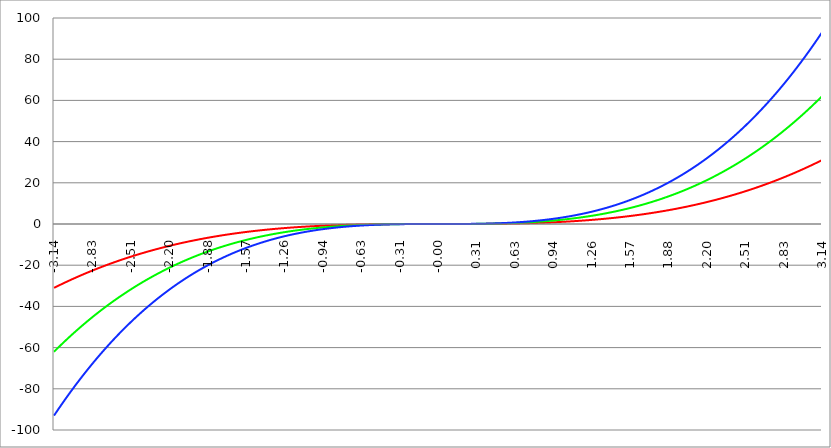
| Category | Series 1 | Series 0 | Series 2 |
|---|---|---|---|
| -3.141592653589793 | -31.006 | -62.013 | -93.019 |
| -3.138451060936204 | -30.913 | -61.827 | -92.74 |
| -3.135309468282614 | -30.821 | -61.641 | -92.462 |
| -3.132167875629024 | -30.728 | -61.456 | -92.184 |
| -3.129026282975434 | -30.636 | -61.271 | -91.907 |
| -3.125884690321845 | -30.544 | -61.087 | -91.631 |
| -3.122743097668256 | -30.452 | -60.903 | -91.355 |
| -3.119601505014666 | -30.36 | -60.719 | -91.079 |
| -3.116459912361076 | -30.268 | -60.536 | -90.804 |
| -3.113318319707487 | -30.177 | -60.353 | -90.53 |
| -3.110176727053897 | -30.085 | -60.171 | -90.256 |
| -3.107035134400308 | -29.994 | -59.989 | -89.983 |
| -3.103893541746717 | -29.903 | -59.807 | -89.71 |
| -3.100751949093128 | -29.813 | -59.625 | -89.438 |
| -3.097610356439539 | -29.722 | -59.444 | -89.166 |
| -3.094468763785949 | -29.632 | -59.264 | -88.895 |
| -3.09132717113236 | -29.542 | -59.083 | -88.625 |
| -3.08818557847877 | -29.452 | -58.903 | -88.355 |
| -3.08504398582518 | -29.362 | -58.724 | -88.086 |
| -3.081902393171591 | -29.272 | -58.545 | -87.817 |
| -3.078760800518001 | -29.183 | -58.366 | -87.549 |
| -3.075619207864412 | -29.094 | -58.187 | -87.281 |
| -3.072477615210822 | -29.005 | -58.009 | -87.014 |
| -3.069336022557232 | -28.916 | -57.831 | -86.747 |
| -3.066194429903643 | -28.827 | -57.654 | -86.481 |
| -3.063052837250053 | -28.738 | -57.477 | -86.215 |
| -3.059911244596463 | -28.65 | -57.3 | -85.95 |
| -3.056769651942874 | -28.562 | -57.124 | -85.686 |
| -3.053628059289284 | -28.474 | -56.948 | -85.422 |
| -3.050486466635695 | -28.386 | -56.772 | -85.159 |
| -3.047344873982105 | -28.299 | -56.597 | -84.896 |
| -3.044203281328516 | -28.211 | -56.422 | -84.633 |
| -3.041061688674926 | -28.124 | -56.248 | -84.372 |
| -3.037920096021336 | -28.037 | -56.074 | -84.111 |
| -3.034778503367747 | -27.95 | -55.9 | -83.85 |
| -3.031636910714157 | -27.863 | -55.726 | -83.59 |
| -3.028495318060568 | -27.777 | -55.553 | -83.33 |
| -3.025353725406978 | -27.69 | -55.381 | -83.071 |
| -3.022212132753388 | -27.604 | -55.208 | -82.813 |
| -3.019070540099799 | -27.518 | -55.036 | -82.555 |
| -3.015928947446209 | -27.432 | -54.865 | -82.297 |
| -3.01278735479262 | -27.347 | -54.693 | -82.04 |
| -3.00964576213903 | -27.261 | -54.523 | -81.784 |
| -3.00650416948544 | -27.176 | -54.352 | -81.528 |
| -3.003362576831851 | -27.091 | -54.182 | -81.273 |
| -3.000220984178261 | -27.006 | -54.012 | -81.018 |
| -2.997079391524672 | -26.921 | -53.842 | -80.764 |
| -2.993937798871082 | -26.837 | -53.673 | -80.51 |
| -2.990796206217492 | -26.752 | -53.505 | -80.257 |
| -2.987654613563903 | -26.668 | -53.336 | -80.004 |
| -2.984513020910313 | -26.584 | -53.168 | -79.752 |
| -2.981371428256724 | -26.5 | -53 | -79.5 |
| -2.978229835603134 | -26.416 | -52.833 | -79.249 |
| -2.975088242949544 | -26.333 | -52.666 | -78.999 |
| -2.971946650295955 | -26.25 | -52.499 | -78.749 |
| -2.968805057642365 | -26.166 | -52.333 | -78.499 |
| -2.965663464988776 | -26.083 | -52.167 | -78.25 |
| -2.962521872335186 | -26.001 | -52.001 | -78.002 |
| -2.959380279681596 | -25.918 | -51.836 | -77.754 |
| -2.956238687028007 | -25.836 | -51.671 | -77.507 |
| -2.953097094374417 | -25.753 | -51.507 | -77.26 |
| -2.949955501720828 | -25.671 | -51.342 | -77.014 |
| -2.946813909067238 | -25.589 | -51.179 | -76.768 |
| -2.943672316413648 | -25.508 | -51.015 | -76.523 |
| -2.940530723760059 | -25.426 | -50.852 | -76.278 |
| -2.937389131106469 | -25.345 | -50.689 | -76.034 |
| -2.93424753845288 | -25.263 | -50.527 | -75.79 |
| -2.93110594579929 | -25.182 | -50.365 | -75.547 |
| -2.9279643531457 | -25.101 | -50.203 | -75.304 |
| -2.924822760492111 | -25.021 | -50.041 | -75.062 |
| -2.921681167838521 | -24.94 | -49.88 | -74.82 |
| -2.918539575184932 | -24.86 | -49.72 | -74.579 |
| -2.915397982531342 | -24.78 | -49.559 | -74.339 |
| -2.912256389877752 | -24.7 | -49.399 | -74.099 |
| -2.909114797224163 | -24.62 | -49.239 | -73.859 |
| -2.905973204570573 | -24.54 | -49.08 | -73.62 |
| -2.902831611916984 | -24.461 | -48.921 | -73.382 |
| -2.899690019263394 | -24.381 | -48.762 | -73.144 |
| -2.896548426609804 | -24.302 | -48.604 | -72.906 |
| -2.893406833956215 | -24.223 | -48.446 | -72.669 |
| -2.890265241302625 | -24.144 | -48.288 | -72.433 |
| -2.887123648649035 | -24.066 | -48.131 | -72.197 |
| -2.883982055995446 | -23.987 | -47.974 | -71.961 |
| -2.880840463341856 | -23.909 | -47.818 | -71.726 |
| -2.877698870688267 | -23.831 | -47.661 | -71.492 |
| -2.874557278034677 | -23.753 | -47.505 | -71.258 |
| -2.871415685381088 | -23.675 | -47.35 | -71.025 |
| -2.868274092727498 | -23.597 | -47.195 | -70.792 |
| -2.865132500073908 | -23.52 | -47.04 | -70.559 |
| -2.861990907420319 | -23.443 | -46.885 | -70.328 |
| -2.858849314766729 | -23.365 | -46.731 | -70.096 |
| -2.85570772211314 | -23.288 | -46.577 | -69.865 |
| -2.85256612945955 | -23.212 | -46.423 | -69.635 |
| -2.84942453680596 | -23.135 | -46.27 | -69.405 |
| -2.846282944152371 | -23.059 | -46.117 | -69.176 |
| -2.843141351498781 | -22.982 | -45.965 | -68.947 |
| -2.839999758845192 | -22.906 | -45.813 | -68.719 |
| -2.836858166191602 | -22.83 | -45.661 | -68.491 |
| -2.833716573538012 | -22.755 | -45.509 | -68.264 |
| -2.830574980884423 | -22.679 | -45.358 | -68.037 |
| -2.827433388230833 | -22.604 | -45.207 | -67.811 |
| -2.824291795577244 | -22.528 | -45.057 | -67.585 |
| -2.821150202923654 | -22.453 | -44.906 | -67.36 |
| -2.818008610270065 | -22.378 | -44.757 | -67.135 |
| -2.814867017616475 | -22.304 | -44.607 | -66.911 |
| -2.811725424962885 | -22.229 | -44.458 | -66.687 |
| -2.808583832309296 | -22.155 | -44.309 | -66.464 |
| -2.805442239655706 | -22.08 | -44.161 | -66.241 |
| -2.802300647002116 | -22.006 | -44.012 | -66.018 |
| -2.799159054348527 | -21.932 | -43.864 | -65.797 |
| -2.796017461694937 | -21.858 | -43.717 | -65.575 |
| -2.792875869041348 | -21.785 | -43.57 | -65.355 |
| -2.789734276387758 | -21.711 | -43.423 | -65.134 |
| -2.786592683734168 | -21.638 | -43.276 | -64.915 |
| -2.783451091080579 | -21.565 | -43.13 | -64.695 |
| -2.78030949842699 | -21.492 | -42.984 | -64.476 |
| -2.7771679057734 | -21.419 | -42.839 | -64.258 |
| -2.77402631311981 | -21.347 | -42.693 | -64.04 |
| -2.770884720466221 | -21.274 | -42.549 | -63.823 |
| -2.767743127812631 | -21.202 | -42.404 | -63.606 |
| -2.764601535159041 | -21.13 | -42.26 | -63.39 |
| -2.761459942505452 | -21.058 | -42.116 | -63.174 |
| -2.758318349851862 | -20.986 | -41.972 | -62.959 |
| -2.755176757198272 | -20.915 | -41.829 | -62.744 |
| -2.752035164544683 | -20.843 | -41.686 | -62.529 |
| -2.748893571891093 | -20.772 | -41.544 | -62.315 |
| -2.745751979237504 | -20.701 | -41.401 | -62.102 |
| -2.742610386583914 | -20.63 | -41.259 | -61.889 |
| -2.739468793930325 | -20.559 | -41.118 | -61.677 |
| -2.736327201276735 | -20.488 | -40.976 | -61.465 |
| -2.733185608623145 | -20.418 | -40.835 | -61.253 |
| -2.730044015969556 | -20.347 | -40.695 | -61.042 |
| -2.726902423315966 | -20.277 | -40.554 | -60.832 |
| -2.723760830662376 | -20.207 | -40.414 | -60.622 |
| -2.720619238008787 | -20.137 | -40.275 | -60.412 |
| -2.717477645355197 | -20.068 | -40.135 | -60.203 |
| -2.714336052701607 | -19.998 | -39.996 | -59.995 |
| -2.711194460048018 | -19.929 | -39.858 | -59.787 |
| -2.708052867394429 | -19.86 | -39.719 | -59.579 |
| -2.704911274740839 | -19.791 | -39.581 | -59.372 |
| -2.701769682087249 | -19.722 | -39.443 | -59.165 |
| -2.69862808943366 | -19.653 | -39.306 | -58.959 |
| -2.69548649678007 | -19.584 | -39.169 | -58.753 |
| -2.692344904126481 | -19.516 | -39.032 | -58.548 |
| -2.689203311472891 | -19.448 | -38.896 | -58.343 |
| -2.686061718819301 | -19.38 | -38.759 | -58.139 |
| -2.682920126165712 | -19.312 | -38.624 | -57.935 |
| -2.679778533512122 | -19.244 | -38.488 | -57.732 |
| -2.676636940858533 | -19.176 | -38.353 | -57.529 |
| -2.673495348204943 | -19.109 | -38.218 | -57.327 |
| -2.670353755551353 | -19.042 | -38.083 | -57.125 |
| -2.667212162897764 | -18.975 | -37.949 | -56.924 |
| -2.664070570244174 | -18.908 | -37.815 | -56.723 |
| -2.660928977590585 | -18.841 | -37.682 | -56.522 |
| -2.657787384936995 | -18.774 | -37.548 | -56.323 |
| -2.654645792283405 | -18.708 | -37.415 | -56.123 |
| -2.651504199629816 | -18.641 | -37.283 | -55.924 |
| -2.648362606976226 | -18.575 | -37.15 | -55.725 |
| -2.645221014322636 | -18.509 | -37.018 | -55.527 |
| -2.642079421669047 | -18.443 | -36.887 | -55.33 |
| -2.638937829015457 | -18.378 | -36.755 | -55.133 |
| -2.635796236361868 | -18.312 | -36.624 | -54.936 |
| -2.632654643708278 | -18.247 | -36.493 | -54.74 |
| -2.629513051054689 | -18.181 | -36.363 | -54.544 |
| -2.626371458401099 | -18.116 | -36.233 | -54.349 |
| -2.62322986574751 | -18.051 | -36.103 | -54.154 |
| -2.62008827309392 | -17.987 | -35.973 | -53.96 |
| -2.61694668044033 | -17.922 | -35.844 | -53.766 |
| -2.613805087786741 | -17.857 | -35.715 | -53.572 |
| -2.610663495133151 | -17.793 | -35.586 | -53.379 |
| -2.607521902479561 | -17.729 | -35.458 | -53.187 |
| -2.604380309825972 | -17.665 | -35.33 | -52.995 |
| -2.601238717172382 | -17.601 | -35.202 | -52.803 |
| -2.598097124518793 | -17.537 | -35.075 | -52.612 |
| -2.594955531865203 | -17.474 | -34.948 | -52.422 |
| -2.591813939211613 | -17.411 | -34.821 | -52.232 |
| -2.588672346558024 | -17.347 | -34.695 | -52.042 |
| -2.585530753904434 | -17.284 | -34.568 | -51.853 |
| -2.582389161250845 | -17.221 | -34.443 | -51.664 |
| -2.579247568597255 | -17.158 | -34.317 | -51.475 |
| -2.576105975943666 | -17.096 | -34.192 | -51.288 |
| -2.572964383290076 | -17.033 | -34.067 | -51.1 |
| -2.569822790636486 | -16.971 | -33.942 | -50.913 |
| -2.566681197982897 | -16.909 | -33.818 | -50.727 |
| -2.563539605329307 | -16.847 | -33.694 | -50.541 |
| -2.560398012675717 | -16.785 | -33.57 | -50.355 |
| -2.557256420022128 | -16.723 | -33.447 | -50.17 |
| -2.554114827368538 | -16.662 | -33.324 | -49.985 |
| -2.550973234714949 | -16.6 | -33.201 | -49.801 |
| -2.54783164206136 | -16.539 | -33.078 | -49.617 |
| -2.54469004940777 | -16.478 | -32.956 | -49.434 |
| -2.54154845675418 | -16.417 | -32.834 | -49.251 |
| -2.53840686410059 | -16.356 | -32.712 | -49.069 |
| -2.535265271447001 | -16.296 | -32.591 | -48.887 |
| -2.532123678793411 | -16.235 | -32.47 | -48.705 |
| -2.528982086139822 | -16.175 | -32.349 | -48.524 |
| -2.525840493486232 | -16.115 | -32.229 | -48.344 |
| -2.522698900832642 | -16.054 | -32.109 | -48.163 |
| -2.519557308179053 | -15.995 | -31.989 | -47.984 |
| -2.516415715525463 | -15.935 | -31.87 | -47.804 |
| -2.513274122871874 | -15.875 | -31.75 | -47.626 |
| -2.510132530218284 | -15.816 | -31.632 | -47.447 |
| -2.506990937564694 | -15.756 | -31.513 | -47.269 |
| -2.503849344911105 | -15.697 | -31.395 | -47.092 |
| -2.500707752257515 | -15.638 | -31.277 | -46.915 |
| -2.497566159603926 | -15.579 | -31.159 | -46.738 |
| -2.494424566950336 | -15.521 | -31.041 | -46.562 |
| -2.491282974296746 | -15.462 | -30.924 | -46.386 |
| -2.488141381643157 | -15.404 | -30.807 | -46.211 |
| -2.484999788989567 | -15.345 | -30.691 | -46.036 |
| -2.481858196335978 | -15.287 | -30.575 | -45.862 |
| -2.478716603682388 | -15.229 | -30.459 | -45.688 |
| -2.475575011028798 | -15.171 | -30.343 | -45.514 |
| -2.472433418375209 | -15.114 | -30.228 | -45.341 |
| -2.46929182572162 | -15.056 | -30.113 | -45.169 |
| -2.46615023306803 | -14.999 | -29.998 | -44.997 |
| -2.46300864041444 | -14.942 | -29.883 | -44.825 |
| -2.45986704776085 | -14.885 | -29.769 | -44.654 |
| -2.456725455107261 | -14.828 | -29.655 | -44.483 |
| -2.453583862453671 | -14.771 | -29.542 | -44.312 |
| -2.450442269800082 | -14.714 | -29.428 | -44.142 |
| -2.447300677146492 | -14.658 | -29.315 | -43.973 |
| -2.444159084492902 | -14.601 | -29.202 | -43.804 |
| -2.441017491839313 | -14.545 | -29.09 | -43.635 |
| -2.437875899185723 | -14.489 | -28.978 | -43.467 |
| -2.434734306532133 | -14.433 | -28.866 | -43.299 |
| -2.431592713878544 | -14.377 | -28.754 | -43.131 |
| -2.428451121224954 | -14.321 | -28.643 | -42.964 |
| -2.425309528571365 | -14.266 | -28.532 | -42.798 |
| -2.422167935917775 | -14.211 | -28.421 | -42.632 |
| -2.419026343264186 | -14.155 | -28.311 | -42.466 |
| -2.415884750610596 | -14.1 | -28.201 | -42.301 |
| -2.412743157957006 | -14.045 | -28.091 | -42.136 |
| -2.409601565303417 | -13.991 | -27.981 | -41.972 |
| -2.406459972649827 | -13.936 | -27.872 | -41.808 |
| -2.403318379996238 | -13.881 | -27.763 | -41.644 |
| -2.400176787342648 | -13.827 | -27.654 | -41.481 |
| -2.397035194689058 | -13.773 | -27.546 | -41.318 |
| -2.393893602035469 | -13.719 | -27.437 | -41.156 |
| -2.390752009381879 | -13.665 | -27.33 | -40.994 |
| -2.38761041672829 | -13.611 | -27.222 | -40.833 |
| -2.3844688240747 | -13.557 | -27.115 | -40.672 |
| -2.38132723142111 | -13.504 | -27.008 | -40.512 |
| -2.378185638767521 | -13.45 | -26.901 | -40.351 |
| -2.375044046113931 | -13.397 | -26.794 | -40.192 |
| -2.371902453460342 | -13.344 | -26.688 | -40.032 |
| -2.368760860806752 | -13.291 | -26.582 | -39.874 |
| -2.365619268153162 | -13.238 | -26.477 | -39.715 |
| -2.362477675499573 | -13.186 | -26.371 | -39.557 |
| -2.359336082845983 | -13.133 | -26.266 | -39.399 |
| -2.356194490192394 | -13.081 | -26.162 | -39.242 |
| -2.353052897538804 | -13.029 | -26.057 | -39.086 |
| -2.349911304885214 | -12.976 | -25.953 | -38.929 |
| -2.346769712231625 | -12.924 | -25.849 | -38.773 |
| -2.343628119578035 | -12.873 | -25.745 | -38.618 |
| -2.340486526924446 | -12.821 | -25.642 | -38.463 |
| -2.337344934270856 | -12.769 | -25.539 | -38.308 |
| -2.334203341617266 | -12.718 | -25.436 | -38.154 |
| -2.331061748963677 | -12.667 | -25.333 | -38 |
| -2.327920156310087 | -12.615 | -25.231 | -37.846 |
| -2.324778563656498 | -12.564 | -25.129 | -37.693 |
| -2.321636971002908 | -12.514 | -25.027 | -37.541 |
| -2.318495378349318 | -12.463 | -24.926 | -37.389 |
| -2.315353785695729 | -12.412 | -24.825 | -37.237 |
| -2.312212193042139 | -12.362 | -24.724 | -37.086 |
| -2.30907060038855 | -12.312 | -24.623 | -36.935 |
| -2.30592900773496 | -12.261 | -24.523 | -36.784 |
| -2.30278741508137 | -12.211 | -24.423 | -36.634 |
| -2.299645822427781 | -12.161 | -24.323 | -36.484 |
| -2.296504229774191 | -12.112 | -24.223 | -36.335 |
| -2.293362637120602 | -12.062 | -24.124 | -36.186 |
| -2.290221044467012 | -12.012 | -24.025 | -36.037 |
| -2.287079451813422 | -11.963 | -23.926 | -35.889 |
| -2.283937859159832 | -11.914 | -23.828 | -35.742 |
| -2.280796266506243 | -11.865 | -23.73 | -35.594 |
| -2.277654673852654 | -11.816 | -23.632 | -35.447 |
| -2.274513081199064 | -11.767 | -23.534 | -35.301 |
| -2.271371488545474 | -11.718 | -23.437 | -35.155 |
| -2.268229895891885 | -11.67 | -23.339 | -35.009 |
| -2.265088303238295 | -11.621 | -23.243 | -34.864 |
| -2.261946710584706 | -11.573 | -23.146 | -34.719 |
| -2.258805117931116 | -11.525 | -23.05 | -34.575 |
| -2.255663525277527 | -11.477 | -22.954 | -34.431 |
| -2.252521932623937 | -11.429 | -22.858 | -34.287 |
| -2.249380339970347 | -11.381 | -22.762 | -34.144 |
| -2.246238747316757 | -11.334 | -22.667 | -34.001 |
| -2.243097154663168 | -11.286 | -22.572 | -33.858 |
| -2.239955562009579 | -11.239 | -22.478 | -33.716 |
| -2.236813969355989 | -11.192 | -22.383 | -33.575 |
| -2.2336723767024 | -11.144 | -22.289 | -33.433 |
| -2.23053078404881 | -11.097 | -22.195 | -33.292 |
| -2.22738919139522 | -11.051 | -22.101 | -33.152 |
| -2.22424759874163 | -11.004 | -22.008 | -33.012 |
| -2.221106006088041 | -10.957 | -21.915 | -32.872 |
| -2.217964413434451 | -10.911 | -21.822 | -32.733 |
| -2.214822820780862 | -10.865 | -21.729 | -32.594 |
| -2.211681228127272 | -10.819 | -21.637 | -32.456 |
| -2.208539635473683 | -10.772 | -21.545 | -32.317 |
| -2.205398042820092 | -10.727 | -21.453 | -32.18 |
| -2.202256450166503 | -10.681 | -21.362 | -32.042 |
| -2.199114857512913 | -10.635 | -21.27 | -31.905 |
| -2.195973264859324 | -10.59 | -21.179 | -31.769 |
| -2.192831672205735 | -10.544 | -21.089 | -31.633 |
| -2.189690079552145 | -10.499 | -20.998 | -31.497 |
| -2.186548486898555 | -10.454 | -20.908 | -31.362 |
| -2.183406894244966 | -10.409 | -20.818 | -31.227 |
| -2.180265301591376 | -10.364 | -20.728 | -31.092 |
| -2.177123708937786 | -10.319 | -20.639 | -30.958 |
| -2.173982116284197 | -10.275 | -20.549 | -30.824 |
| -2.170840523630607 | -10.23 | -20.46 | -30.691 |
| -2.167698930977018 | -10.186 | -20.372 | -30.558 |
| -2.164557338323428 | -10.142 | -20.283 | -30.425 |
| -2.161415745669839 | -10.098 | -20.195 | -30.293 |
| -2.158274153016249 | -10.054 | -20.107 | -30.161 |
| -2.15513256036266 | -10.01 | -20.019 | -30.029 |
| -2.15199096770907 | -9.966 | -19.932 | -29.898 |
| -2.14884937505548 | -9.922 | -19.845 | -29.767 |
| -2.14570778240189 | -9.879 | -19.758 | -29.637 |
| -2.142566189748301 | -9.836 | -19.671 | -29.507 |
| -2.139424597094711 | -9.792 | -19.585 | -29.377 |
| -2.136283004441122 | -9.749 | -19.499 | -29.248 |
| -2.133141411787532 | -9.706 | -19.413 | -29.119 |
| -2.129999819133943 | -9.664 | -19.327 | -28.991 |
| -2.126858226480353 | -9.621 | -19.242 | -28.863 |
| -2.123716633826763 | -9.578 | -19.157 | -28.735 |
| -2.120575041173174 | -9.536 | -19.072 | -28.608 |
| -2.117433448519584 | -9.494 | -18.987 | -28.481 |
| -2.114291855865994 | -9.451 | -18.903 | -28.354 |
| -2.111150263212405 | -9.409 | -18.819 | -28.228 |
| -2.108008670558815 | -9.367 | -18.735 | -28.102 |
| -2.104867077905226 | -9.326 | -18.651 | -27.977 |
| -2.101725485251636 | -9.284 | -18.568 | -27.852 |
| -2.098583892598047 | -9.242 | -18.485 | -27.727 |
| -2.095442299944457 | -9.201 | -18.402 | -27.602 |
| -2.092300707290867 | -9.16 | -18.319 | -27.479 |
| -2.089159114637278 | -9.118 | -18.237 | -27.355 |
| -2.086017521983688 | -9.077 | -18.154 | -27.232 |
| -2.082875929330099 | -9.036 | -18.073 | -27.109 |
| -2.07973433667651 | -8.995 | -17.991 | -26.986 |
| -2.07659274402292 | -8.955 | -17.91 | -26.864 |
| -2.07345115136933 | -8.914 | -17.828 | -26.743 |
| -2.07030955871574 | -8.874 | -17.747 | -26.621 |
| -2.06716796606215 | -8.833 | -17.667 | -26.5 |
| -2.064026373408561 | -8.793 | -17.586 | -26.38 |
| -2.060884780754971 | -8.753 | -17.506 | -26.259 |
| -2.057743188101382 | -8.713 | -17.426 | -26.139 |
| -2.054601595447792 | -8.673 | -17.347 | -26.02 |
| -2.051460002794203 | -8.634 | -17.267 | -25.901 |
| -2.048318410140613 | -8.594 | -17.188 | -25.782 |
| -2.045176817487023 | -8.554 | -17.109 | -25.663 |
| -2.042035224833434 | -8.515 | -17.03 | -25.545 |
| -2.038893632179844 | -8.476 | -16.952 | -25.428 |
| -2.035752039526255 | -8.437 | -16.873 | -25.31 |
| -2.032610446872665 | -8.398 | -16.795 | -25.193 |
| -2.029468854219076 | -8.359 | -16.718 | -25.077 |
| -2.026327261565486 | -8.32 | -16.64 | -24.96 |
| -2.023185668911896 | -8.281 | -16.563 | -24.844 |
| -2.020044076258307 | -8.243 | -16.486 | -24.729 |
| -2.016902483604717 | -8.205 | -16.409 | -24.614 |
| -2.013760890951128 | -8.166 | -16.333 | -24.499 |
| -2.010619298297538 | -8.128 | -16.256 | -24.384 |
| -2.007477705643948 | -8.09 | -16.18 | -24.27 |
| -2.004336112990358 | -8.052 | -16.104 | -24.156 |
| -2.00119452033677 | -8.014 | -16.029 | -24.043 |
| -1.99805292768318 | -7.977 | -15.953 | -23.93 |
| -1.994911335029589 | -7.939 | -15.878 | -23.817 |
| -1.991769742376 | -7.902 | -15.803 | -23.705 |
| -1.98862814972241 | -7.864 | -15.729 | -23.593 |
| -1.98548655706882 | -7.827 | -15.654 | -23.481 |
| -1.98234496441523 | -7.79 | -15.58 | -23.37 |
| -1.97920337176164 | -7.753 | -15.506 | -23.259 |
| -1.976061779108051 | -7.716 | -15.432 | -23.148 |
| -1.972920186454461 | -7.679 | -15.359 | -23.038 |
| -1.969778593800871 | -7.643 | -15.286 | -22.928 |
| -1.966637001147281 | -7.606 | -15.213 | -22.819 |
| -1.963495408493691 | -7.57 | -15.14 | -22.71 |
| -1.960353815840101 | -7.534 | -15.067 | -22.601 |
| -1.957212223186512 | -7.497 | -14.995 | -22.492 |
| -1.954070630532922 | -7.461 | -14.923 | -22.384 |
| -1.950929037879332 | -7.425 | -14.851 | -22.276 |
| -1.947787445225742 | -7.39 | -14.779 | -22.169 |
| -1.944645852572152 | -7.354 | -14.708 | -22.062 |
| -1.941504259918563 | -7.318 | -14.637 | -21.955 |
| -1.938362667264973 | -7.283 | -14.566 | -21.849 |
| -1.935221074611383 | -7.248 | -14.495 | -21.743 |
| -1.932079481957793 | -7.212 | -14.425 | -21.637 |
| -1.928937889304203 | -7.177 | -14.354 | -21.532 |
| -1.925796296650613 | -7.142 | -14.284 | -21.427 |
| -1.922654703997024 | -7.107 | -14.215 | -21.322 |
| -1.919513111343434 | -7.073 | -14.145 | -21.218 |
| -1.916371518689844 | -7.038 | -14.076 | -21.114 |
| -1.913229926036254 | -7.003 | -14.007 | -21.01 |
| -1.910088333382664 | -6.969 | -13.938 | -20.907 |
| -1.906946740729075 | -6.935 | -13.869 | -20.804 |
| -1.903805148075485 | -6.9 | -13.801 | -20.701 |
| -1.900663555421895 | -6.866 | -13.732 | -20.599 |
| -1.897521962768305 | -6.832 | -13.664 | -20.497 |
| -1.894380370114715 | -6.798 | -13.597 | -20.395 |
| -1.891238777461125 | -6.765 | -13.529 | -20.294 |
| -1.888097184807536 | -6.731 | -13.462 | -20.193 |
| -1.884955592153946 | -6.697 | -13.395 | -20.092 |
| -1.881813999500356 | -6.664 | -13.328 | -19.992 |
| -1.878672406846766 | -6.631 | -13.261 | -19.892 |
| -1.875530814193176 | -6.597 | -13.195 | -19.792 |
| -1.872389221539586 | -6.564 | -13.129 | -19.693 |
| -1.869247628885997 | -6.531 | -13.063 | -19.594 |
| -1.866106036232407 | -6.498 | -12.997 | -19.495 |
| -1.862964443578817 | -6.466 | -12.931 | -19.397 |
| -1.859822850925227 | -6.433 | -12.866 | -19.299 |
| -1.856681258271637 | -6.4 | -12.801 | -19.201 |
| -1.853539665618048 | -6.368 | -12.736 | -19.104 |
| -1.850398072964458 | -6.336 | -12.671 | -19.007 |
| -1.847256480310868 | -6.303 | -12.607 | -18.91 |
| -1.844114887657278 | -6.271 | -12.543 | -18.814 |
| -1.840973295003688 | -6.239 | -12.479 | -18.718 |
| -1.837831702350098 | -6.208 | -12.415 | -18.623 |
| -1.834690109696509 | -6.176 | -12.351 | -18.527 |
| -1.831548517042919 | -6.144 | -12.288 | -18.432 |
| -1.82840692438933 | -6.112 | -12.225 | -18.337 |
| -1.82526533173574 | -6.081 | -12.162 | -18.243 |
| -1.822123739082149 | -6.05 | -12.099 | -18.149 |
| -1.81898214642856 | -6.018 | -12.037 | -18.055 |
| -1.81584055377497 | -5.987 | -11.975 | -17.962 |
| -1.81269896112138 | -5.956 | -11.913 | -17.869 |
| -1.80955736846779 | -5.925 | -11.851 | -17.776 |
| -1.8064157758142 | -5.895 | -11.789 | -17.684 |
| -1.80327418316061 | -5.864 | -11.728 | -17.592 |
| -1.800132590507021 | -5.833 | -11.667 | -17.5 |
| -1.796990997853431 | -5.803 | -11.606 | -17.408 |
| -1.793849405199841 | -5.772 | -11.545 | -17.317 |
| -1.790707812546251 | -5.742 | -11.484 | -17.226 |
| -1.787566219892661 | -5.712 | -11.424 | -17.136 |
| -1.784424627239071 | -5.682 | -11.364 | -17.046 |
| -1.781283034585482 | -5.652 | -11.304 | -16.956 |
| -1.778141441931892 | -5.622 | -11.244 | -16.866 |
| -1.774999849278302 | -5.592 | -11.185 | -16.777 |
| -1.771858256624712 | -5.563 | -11.125 | -16.688 |
| -1.768716663971122 | -5.533 | -11.066 | -16.6 |
| -1.765575071317533 | -5.504 | -11.007 | -16.511 |
| -1.762433478663943 | -5.474 | -10.949 | -16.423 |
| -1.759291886010353 | -5.445 | -10.89 | -16.336 |
| -1.756150293356763 | -5.416 | -10.832 | -16.248 |
| -1.753008700703173 | -5.387 | -10.774 | -16.161 |
| -1.749867108049583 | -5.358 | -10.716 | -16.074 |
| -1.746725515395994 | -5.329 | -10.659 | -15.988 |
| -1.743583922742404 | -5.301 | -10.601 | -15.902 |
| -1.740442330088814 | -5.272 | -10.544 | -15.816 |
| -1.737300737435224 | -5.244 | -10.487 | -15.731 |
| -1.734159144781634 | -5.215 | -10.43 | -15.645 |
| -1.731017552128045 | -5.187 | -10.374 | -15.561 |
| -1.727875959474455 | -5.159 | -10.317 | -15.476 |
| -1.724734366820865 | -5.131 | -10.261 | -15.392 |
| -1.721592774167275 | -5.103 | -10.205 | -15.308 |
| -1.718451181513685 | -5.075 | -10.149 | -15.224 |
| -1.715309588860095 | -5.047 | -10.094 | -15.141 |
| -1.712167996206506 | -5.019 | -10.039 | -15.058 |
| -1.709026403552916 | -4.992 | -9.983 | -14.975 |
| -1.705884810899326 | -4.964 | -9.928 | -14.893 |
| -1.702743218245736 | -4.937 | -9.874 | -14.81 |
| -1.699601625592146 | -4.91 | -9.819 | -14.729 |
| -1.696460032938557 | -4.882 | -9.765 | -14.647 |
| -1.693318440284967 | -4.855 | -9.711 | -14.566 |
| -1.690176847631377 | -4.828 | -9.657 | -14.485 |
| -1.687035254977787 | -4.801 | -9.603 | -14.404 |
| -1.683893662324197 | -4.775 | -9.549 | -14.324 |
| -1.680752069670607 | -4.748 | -9.496 | -14.244 |
| -1.677610477017018 | -4.721 | -9.443 | -14.164 |
| -1.674468884363428 | -4.695 | -9.39 | -14.085 |
| -1.671327291709838 | -4.669 | -9.337 | -14.006 |
| -1.668185699056248 | -4.642 | -9.285 | -13.927 |
| -1.665044106402658 | -4.616 | -9.232 | -13.848 |
| -1.661902513749069 | -4.59 | -9.18 | -13.77 |
| -1.658760921095479 | -4.564 | -9.128 | -13.692 |
| -1.655619328441889 | -4.538 | -9.076 | -13.615 |
| -1.6524777357883 | -4.512 | -9.025 | -13.537 |
| -1.649336143134709 | -4.487 | -8.973 | -13.46 |
| -1.646194550481119 | -4.461 | -8.922 | -13.383 |
| -1.64305295782753 | -4.436 | -8.871 | -13.307 |
| -1.63991136517394 | -4.41 | -8.82 | -13.231 |
| -1.63676977252035 | -4.385 | -8.77 | -13.155 |
| -1.63362817986676 | -4.36 | -8.719 | -13.079 |
| -1.63048658721317 | -4.335 | -8.669 | -13.004 |
| -1.62734499455958 | -4.31 | -8.619 | -12.929 |
| -1.624203401905991 | -4.285 | -8.569 | -12.854 |
| -1.621061809252401 | -4.26 | -8.52 | -12.78 |
| -1.617920216598811 | -4.235 | -8.47 | -12.706 |
| -1.614778623945221 | -4.211 | -8.421 | -12.632 |
| -1.611637031291631 | -4.186 | -8.372 | -12.558 |
| -1.608495438638042 | -4.162 | -8.323 | -12.485 |
| -1.605353845984452 | -4.137 | -8.275 | -12.412 |
| -1.602212253330862 | -4.113 | -8.226 | -12.339 |
| -1.599070660677272 | -4.089 | -8.178 | -12.267 |
| -1.595929068023682 | -4.065 | -8.13 | -12.194 |
| -1.592787475370093 | -4.041 | -8.082 | -12.123 |
| -1.589645882716503 | -4.017 | -8.034 | -12.051 |
| -1.586504290062913 | -3.993 | -7.986 | -11.98 |
| -1.583362697409323 | -3.97 | -7.939 | -11.909 |
| -1.580221104755733 | -3.946 | -7.892 | -11.838 |
| -1.577079512102143 | -3.922 | -7.845 | -11.767 |
| -1.573937919448554 | -3.899 | -7.798 | -11.697 |
| -1.570796326794964 | -3.876 | -7.752 | -11.627 |
| -1.567654734141374 | -3.853 | -7.705 | -11.558 |
| -1.564513141487784 | -3.829 | -7.659 | -11.488 |
| -1.561371548834194 | -3.806 | -7.613 | -11.419 |
| -1.558229956180605 | -3.784 | -7.567 | -11.351 |
| -1.555088363527015 | -3.761 | -7.521 | -11.282 |
| -1.551946770873425 | -3.738 | -7.476 | -11.214 |
| -1.548805178219835 | -3.715 | -7.431 | -11.146 |
| -1.545663585566245 | -3.693 | -7.385 | -11.078 |
| -1.542521992912655 | -3.67 | -7.34 | -11.011 |
| -1.539380400259066 | -3.648 | -7.296 | -10.944 |
| -1.536238807605476 | -3.626 | -7.251 | -10.877 |
| -1.533097214951886 | -3.603 | -7.207 | -10.81 |
| -1.529955622298296 | -3.581 | -7.163 | -10.744 |
| -1.526814029644706 | -3.559 | -7.118 | -10.678 |
| -1.523672436991117 | -3.537 | -7.075 | -10.612 |
| -1.520530844337527 | -3.515 | -7.031 | -10.546 |
| -1.517389251683937 | -3.494 | -6.987 | -10.481 |
| -1.514247659030347 | -3.472 | -6.944 | -10.416 |
| -1.511106066376757 | -3.451 | -6.901 | -10.352 |
| -1.507964473723167 | -3.429 | -6.858 | -10.287 |
| -1.504822881069578 | -3.408 | -6.815 | -10.223 |
| -1.501681288415988 | -3.386 | -6.773 | -10.159 |
| -1.498539695762398 | -3.365 | -6.73 | -10.095 |
| -1.495398103108808 | -3.344 | -6.688 | -10.032 |
| -1.492256510455218 | -3.323 | -6.646 | -9.969 |
| -1.489114917801628 | -3.302 | -6.604 | -9.906 |
| -1.485973325148039 | -3.281 | -6.562 | -9.844 |
| -1.482831732494449 | -3.26 | -6.521 | -9.781 |
| -1.47969013984086 | -3.24 | -6.48 | -9.719 |
| -1.476548547187269 | -3.219 | -6.438 | -9.657 |
| -1.473406954533679 | -3.199 | -6.397 | -9.596 |
| -1.47026536188009 | -3.178 | -6.356 | -9.535 |
| -1.4671237692265 | -3.158 | -6.316 | -9.474 |
| -1.46398217657291 | -3.138 | -6.275 | -9.413 |
| -1.46084058391932 | -3.118 | -6.235 | -9.353 |
| -1.45769899126573 | -3.097 | -6.195 | -9.292 |
| -1.45455739861214 | -3.077 | -6.155 | -9.232 |
| -1.451415805958551 | -3.058 | -6.115 | -9.173 |
| -1.448274213304961 | -3.038 | -6.076 | -9.113 |
| -1.445132620651371 | -3.018 | -6.036 | -9.054 |
| -1.441991027997781 | -2.998 | -5.997 | -8.995 |
| -1.438849435344191 | -2.979 | -5.958 | -8.936 |
| -1.435707842690602 | -2.959 | -5.919 | -8.878 |
| -1.432566250037012 | -2.94 | -5.88 | -8.82 |
| -1.429424657383422 | -2.921 | -5.841 | -8.762 |
| -1.426283064729832 | -2.901 | -5.803 | -8.704 |
| -1.423141472076242 | -2.882 | -5.765 | -8.647 |
| -1.419999879422652 | -2.863 | -5.727 | -8.59 |
| -1.416858286769063 | -2.844 | -5.689 | -8.533 |
| -1.413716694115473 | -2.825 | -5.651 | -8.476 |
| -1.410575101461883 | -2.807 | -5.613 | -8.42 |
| -1.407433508808293 | -2.788 | -5.576 | -8.364 |
| -1.404291916154703 | -2.769 | -5.539 | -8.308 |
| -1.401150323501114 | -2.751 | -5.502 | -8.252 |
| -1.398008730847524 | -2.732 | -5.465 | -8.197 |
| -1.394867138193934 | -2.714 | -5.428 | -8.142 |
| -1.391725545540344 | -2.696 | -5.391 | -8.087 |
| -1.388583952886754 | -2.677 | -5.355 | -8.032 |
| -1.385442360233164 | -2.659 | -5.319 | -7.978 |
| -1.382300767579575 | -2.641 | -5.282 | -7.924 |
| -1.379159174925985 | -2.623 | -5.247 | -7.87 |
| -1.376017582272395 | -2.605 | -5.211 | -7.816 |
| -1.372875989618805 | -2.588 | -5.175 | -7.763 |
| -1.369734396965215 | -2.57 | -5.14 | -7.71 |
| -1.366592804311625 | -2.552 | -5.104 | -7.657 |
| -1.363451211658036 | -2.535 | -5.069 | -7.604 |
| -1.360309619004446 | -2.517 | -5.034 | -7.552 |
| -1.357168026350856 | -2.5 | -5 | -7.499 |
| -1.354026433697266 | -2.482 | -4.965 | -7.447 |
| -1.350884841043676 | -2.465 | -4.93 | -7.396 |
| -1.347743248390087 | -2.448 | -4.896 | -7.344 |
| -1.344601655736497 | -2.431 | -4.862 | -7.293 |
| -1.341460063082907 | -2.414 | -4.828 | -7.242 |
| -1.338318470429317 | -2.397 | -4.794 | -7.191 |
| -1.335176877775727 | -2.38 | -4.76 | -7.141 |
| -1.332035285122137 | -2.363 | -4.727 | -7.09 |
| -1.328893692468548 | -2.347 | -4.694 | -7.04 |
| -1.325752099814958 | -2.33 | -4.66 | -6.99 |
| -1.322610507161368 | -2.314 | -4.627 | -6.941 |
| -1.319468914507778 | -2.297 | -4.594 | -6.892 |
| -1.316327321854188 | -2.281 | -4.562 | -6.842 |
| -1.313185729200599 | -2.265 | -4.529 | -6.794 |
| -1.310044136547009 | -2.248 | -4.497 | -6.745 |
| -1.306902543893419 | -2.232 | -4.464 | -6.697 |
| -1.303760951239829 | -2.216 | -4.432 | -6.648 |
| -1.300619358586239 | -2.2 | -4.4 | -6.6 |
| -1.297477765932649 | -2.184 | -4.368 | -6.553 |
| -1.29433617327906 | -2.168 | -4.337 | -6.505 |
| -1.29119458062547 | -2.153 | -4.305 | -6.458 |
| -1.28805298797188 | -2.137 | -4.274 | -6.411 |
| -1.28491139531829 | -2.121 | -4.243 | -6.364 |
| -1.2817698026647 | -2.106 | -4.212 | -6.318 |
| -1.278628210011111 | -2.09 | -4.181 | -6.271 |
| -1.275486617357521 | -2.075 | -4.15 | -6.225 |
| -1.272345024703931 | -2.06 | -4.12 | -6.179 |
| -1.269203432050341 | -2.045 | -4.089 | -6.134 |
| -1.266061839396751 | -2.029 | -4.059 | -6.088 |
| -1.262920246743161 | -2.014 | -4.029 | -6.043 |
| -1.259778654089572 | -1.999 | -3.999 | -5.998 |
| -1.256637061435982 | -1.984 | -3.969 | -5.953 |
| -1.253495468782392 | -1.97 | -3.939 | -5.909 |
| -1.250353876128802 | -1.955 | -3.91 | -5.864 |
| -1.247212283475212 | -1.94 | -3.88 | -5.82 |
| -1.244070690821623 | -1.925 | -3.851 | -5.776 |
| -1.240929098168033 | -1.911 | -3.822 | -5.733 |
| -1.237787505514443 | -1.896 | -3.793 | -5.689 |
| -1.234645912860853 | -1.882 | -3.764 | -5.646 |
| -1.231504320207263 | -1.868 | -3.735 | -5.603 |
| -1.228362727553673 | -1.853 | -3.707 | -5.56 |
| -1.225221134900084 | -1.839 | -3.679 | -5.518 |
| -1.222079542246494 | -1.825 | -3.65 | -5.475 |
| -1.218937949592904 | -1.811 | -3.622 | -5.433 |
| -1.215796356939314 | -1.797 | -3.594 | -5.391 |
| -1.212654764285724 | -1.783 | -3.566 | -5.35 |
| -1.209513171632135 | -1.769 | -3.539 | -5.308 |
| -1.206371578978545 | -1.756 | -3.511 | -5.267 |
| -1.203229986324955 | -1.742 | -3.484 | -5.226 |
| -1.200088393671365 | -1.728 | -3.457 | -5.185 |
| -1.196946801017775 | -1.715 | -3.43 | -5.145 |
| -1.193805208364185 | -1.701 | -3.403 | -5.104 |
| -1.190663615710596 | -1.688 | -3.376 | -5.064 |
| -1.187522023057006 | -1.675 | -3.349 | -5.024 |
| -1.184380430403416 | -1.661 | -3.323 | -4.984 |
| -1.181238837749826 | -1.648 | -3.296 | -4.945 |
| -1.178097245096236 | -1.635 | -3.27 | -4.905 |
| -1.174955652442647 | -1.622 | -3.244 | -4.866 |
| -1.171814059789057 | -1.609 | -3.218 | -4.827 |
| -1.168672467135467 | -1.596 | -3.192 | -4.789 |
| -1.165530874481877 | -1.583 | -3.167 | -4.75 |
| -1.162389281828287 | -1.571 | -3.141 | -4.712 |
| -1.159247689174697 | -1.558 | -3.116 | -4.674 |
| -1.156106096521108 | -1.545 | -3.09 | -4.636 |
| -1.152964503867518 | -1.533 | -3.065 | -4.598 |
| -1.149822911213928 | -1.52 | -3.04 | -4.561 |
| -1.146681318560338 | -1.508 | -3.015 | -4.523 |
| -1.143539725906748 | -1.495 | -2.991 | -4.486 |
| -1.140398133253159 | -1.483 | -2.966 | -4.449 |
| -1.137256540599569 | -1.471 | -2.942 | -4.413 |
| -1.134114947945979 | -1.459 | -2.917 | -4.376 |
| -1.130973355292389 | -1.447 | -2.893 | -4.34 |
| -1.127831762638799 | -1.435 | -2.869 | -4.304 |
| -1.12469016998521 | -1.423 | -2.845 | -4.268 |
| -1.12154857733162 | -1.411 | -2.822 | -4.232 |
| -1.11840698467803 | -1.399 | -2.798 | -4.197 |
| -1.11526539202444 | -1.387 | -2.774 | -4.162 |
| -1.11212379937085 | -1.375 | -2.751 | -4.126 |
| -1.10898220671726 | -1.364 | -2.728 | -4.092 |
| -1.105840614063671 | -1.352 | -2.705 | -4.057 |
| -1.102699021410081 | -1.341 | -2.682 | -4.022 |
| -1.099557428756491 | -1.329 | -2.659 | -3.988 |
| -1.096415836102901 | -1.318 | -2.636 | -3.954 |
| -1.093274243449311 | -1.307 | -2.613 | -3.92 |
| -1.090132650795721 | -1.296 | -2.591 | -3.887 |
| -1.086991058142132 | -1.284 | -2.569 | -3.853 |
| -1.083849465488542 | -1.273 | -2.546 | -3.82 |
| -1.080707872834952 | -1.262 | -2.524 | -3.787 |
| -1.077566280181362 | -1.251 | -2.502 | -3.754 |
| -1.074424687527772 | -1.24 | -2.481 | -3.721 |
| -1.071283094874182 | -1.229 | -2.459 | -3.688 |
| -1.068141502220593 | -1.219 | -2.437 | -3.656 |
| -1.064999909567003 | -1.208 | -2.416 | -3.624 |
| -1.061858316913413 | -1.197 | -2.395 | -3.592 |
| -1.058716724259823 | -1.187 | -2.373 | -3.56 |
| -1.055575131606233 | -1.176 | -2.352 | -3.528 |
| -1.052433538952644 | -1.166 | -2.331 | -3.497 |
| -1.049291946299054 | -1.155 | -2.311 | -3.466 |
| -1.046150353645464 | -1.145 | -2.29 | -3.435 |
| -1.043008760991874 | -1.135 | -2.269 | -3.404 |
| -1.039867168338284 | -1.124 | -2.249 | -3.373 |
| -1.036725575684694 | -1.114 | -2.229 | -3.343 |
| -1.033583983031105 | -1.104 | -2.208 | -3.313 |
| -1.030442390377515 | -1.094 | -2.188 | -3.282 |
| -1.027300797723925 | -1.084 | -2.168 | -3.252 |
| -1.024159205070335 | -1.074 | -2.148 | -3.223 |
| -1.021017612416745 | -1.064 | -2.129 | -3.193 |
| -1.017876019763156 | -1.055 | -2.109 | -3.164 |
| -1.014734427109566 | -1.045 | -2.09 | -3.135 |
| -1.011592834455976 | -1.035 | -2.07 | -3.106 |
| -1.008451241802386 | -1.026 | -2.051 | -3.077 |
| -1.005309649148796 | -1.016 | -2.032 | -3.048 |
| -1.002168056495206 | -1.007 | -2.013 | -3.02 |
| -0.999026463841617 | -0.997 | -1.994 | -2.991 |
| -0.995884871188027 | -0.988 | -1.975 | -2.963 |
| -0.992743278534437 | -0.978 | -1.957 | -2.935 |
| -0.989601685880847 | -0.969 | -1.938 | -2.907 |
| -0.986460093227257 | -0.96 | -1.92 | -2.88 |
| -0.983318500573668 | -0.951 | -1.902 | -2.852 |
| -0.980176907920078 | -0.942 | -1.883 | -2.825 |
| -0.977035315266488 | -0.933 | -1.865 | -2.798 |
| -0.973893722612898 | -0.924 | -1.847 | -2.771 |
| -0.970752129959308 | -0.915 | -1.83 | -2.744 |
| -0.967610537305718 | -0.906 | -1.812 | -2.718 |
| -0.964468944652129 | -0.897 | -1.794 | -2.691 |
| -0.961327351998539 | -0.888 | -1.777 | -2.665 |
| -0.958185759344949 | -0.88 | -1.759 | -2.639 |
| -0.955044166691359 | -0.871 | -1.742 | -2.613 |
| -0.951902574037769 | -0.863 | -1.725 | -2.588 |
| -0.948760981384179 | -0.854 | -1.708 | -2.562 |
| -0.94561938873059 | -0.846 | -1.691 | -2.537 |
| -0.942477796077 | -0.837 | -1.674 | -2.512 |
| -0.93933620342341 | -0.829 | -1.658 | -2.486 |
| -0.93619461076982 | -0.821 | -1.641 | -2.462 |
| -0.93305301811623 | -0.812 | -1.625 | -2.437 |
| -0.929911425462641 | -0.804 | -1.608 | -2.412 |
| -0.926769832809051 | -0.796 | -1.592 | -2.388 |
| -0.923628240155461 | -0.788 | -1.576 | -2.364 |
| -0.920486647501871 | -0.78 | -1.56 | -2.34 |
| -0.917345054848281 | -0.772 | -1.544 | -2.316 |
| -0.914203462194691 | -0.764 | -1.528 | -2.292 |
| -0.911061869541102 | -0.756 | -1.512 | -2.269 |
| -0.907920276887512 | -0.748 | -1.497 | -2.245 |
| -0.904778684233922 | -0.741 | -1.481 | -2.222 |
| -0.901637091580332 | -0.733 | -1.466 | -2.199 |
| -0.898495498926742 | -0.725 | -1.451 | -2.176 |
| -0.895353906273153 | -0.718 | -1.436 | -2.153 |
| -0.892212313619563 | -0.71 | -1.42 | -2.131 |
| -0.889070720965973 | -0.703 | -1.406 | -2.108 |
| -0.885929128312383 | -0.695 | -1.391 | -2.086 |
| -0.882787535658793 | -0.688 | -1.376 | -2.064 |
| -0.879645943005203 | -0.681 | -1.361 | -2.042 |
| -0.876504350351614 | -0.673 | -1.347 | -2.02 |
| -0.873362757698024 | -0.666 | -1.332 | -1.999 |
| -0.870221165044434 | -0.659 | -1.318 | -1.977 |
| -0.867079572390844 | -0.652 | -1.304 | -1.956 |
| -0.863937979737254 | -0.645 | -1.29 | -1.935 |
| -0.860796387083665 | -0.638 | -1.276 | -1.913 |
| -0.857654794430075 | -0.631 | -1.262 | -1.893 |
| -0.854513201776485 | -0.624 | -1.248 | -1.872 |
| -0.851371609122895 | -0.617 | -1.234 | -1.851 |
| -0.848230016469305 | -0.61 | -1.221 | -1.831 |
| -0.845088423815715 | -0.604 | -1.207 | -1.811 |
| -0.841946831162126 | -0.597 | -1.194 | -1.791 |
| -0.838805238508536 | -0.59 | -1.18 | -1.771 |
| -0.835663645854946 | -0.584 | -1.167 | -1.751 |
| -0.832522053201356 | -0.577 | -1.154 | -1.731 |
| -0.829380460547766 | -0.571 | -1.141 | -1.712 |
| -0.826238867894177 | -0.564 | -1.128 | -1.692 |
| -0.823097275240587 | -0.558 | -1.115 | -1.673 |
| -0.819955682586997 | -0.551 | -1.103 | -1.654 |
| -0.816814089933407 | -0.545 | -1.09 | -1.635 |
| -0.813672497279817 | -0.539 | -1.077 | -1.616 |
| -0.810530904626227 | -0.532 | -1.065 | -1.597 |
| -0.807389311972638 | -0.526 | -1.053 | -1.579 |
| -0.804247719319048 | -0.52 | -1.04 | -1.561 |
| -0.801106126665458 | -0.514 | -1.028 | -1.542 |
| -0.797964534011868 | -0.508 | -1.016 | -1.524 |
| -0.794822941358278 | -0.502 | -1.004 | -1.506 |
| -0.791681348704688 | -0.496 | -0.992 | -1.489 |
| -0.788539756051099 | -0.49 | -0.981 | -1.471 |
| -0.785398163397509 | -0.484 | -0.969 | -1.453 |
| -0.782256570743919 | -0.479 | -0.957 | -1.436 |
| -0.779114978090329 | -0.473 | -0.946 | -1.419 |
| -0.775973385436739 | -0.467 | -0.934 | -1.402 |
| -0.77283179278315 | -0.462 | -0.923 | -1.385 |
| -0.76969020012956 | -0.456 | -0.912 | -1.368 |
| -0.76654860747597 | -0.45 | -0.901 | -1.351 |
| -0.76340701482238 | -0.445 | -0.89 | -1.335 |
| -0.76026542216879 | -0.439 | -0.879 | -1.318 |
| -0.7571238295152 | -0.434 | -0.868 | -1.302 |
| -0.753982236861611 | -0.429 | -0.857 | -1.286 |
| -0.750840644208021 | -0.423 | -0.847 | -1.27 |
| -0.747699051554431 | -0.418 | -0.836 | -1.254 |
| -0.744557458900841 | -0.413 | -0.826 | -1.238 |
| -0.741415866247251 | -0.408 | -0.815 | -1.223 |
| -0.738274273593662 | -0.402 | -0.805 | -1.207 |
| -0.735132680940072 | -0.397 | -0.795 | -1.192 |
| -0.731991088286482 | -0.392 | -0.784 | -1.177 |
| -0.728849495632892 | -0.387 | -0.774 | -1.162 |
| -0.725707902979302 | -0.382 | -0.764 | -1.147 |
| -0.722566310325712 | -0.377 | -0.755 | -1.132 |
| -0.719424717672123 | -0.372 | -0.745 | -1.117 |
| -0.716283125018533 | -0.367 | -0.735 | -1.102 |
| -0.713141532364943 | -0.363 | -0.725 | -1.088 |
| -0.709999939711353 | -0.358 | -0.716 | -1.074 |
| -0.706858347057763 | -0.353 | -0.706 | -1.06 |
| -0.703716754404174 | -0.348 | -0.697 | -1.045 |
| -0.700575161750584 | -0.344 | -0.688 | -1.032 |
| -0.697433569096994 | -0.339 | -0.678 | -1.018 |
| -0.694291976443404 | -0.335 | -0.669 | -1.004 |
| -0.691150383789814 | -0.33 | -0.66 | -0.99 |
| -0.688008791136224 | -0.326 | -0.651 | -0.977 |
| -0.684867198482635 | -0.321 | -0.642 | -0.964 |
| -0.681725605829045 | -0.317 | -0.634 | -0.95 |
| -0.678584013175455 | -0.312 | -0.625 | -0.937 |
| -0.675442420521865 | -0.308 | -0.616 | -0.924 |
| -0.672300827868275 | -0.304 | -0.608 | -0.912 |
| -0.669159235214685 | -0.3 | -0.599 | -0.899 |
| -0.666017642561096 | -0.295 | -0.591 | -0.886 |
| -0.662876049907506 | -0.291 | -0.583 | -0.874 |
| -0.659734457253916 | -0.287 | -0.574 | -0.861 |
| -0.656592864600326 | -0.283 | -0.566 | -0.849 |
| -0.653451271946736 | -0.279 | -0.558 | -0.837 |
| -0.650309679293147 | -0.275 | -0.55 | -0.825 |
| -0.647168086639557 | -0.271 | -0.542 | -0.813 |
| -0.644026493985967 | -0.267 | -0.534 | -0.801 |
| -0.640884901332377 | -0.263 | -0.526 | -0.79 |
| -0.637743308678787 | -0.259 | -0.519 | -0.778 |
| -0.634601716025197 | -0.256 | -0.511 | -0.767 |
| -0.631460123371608 | -0.252 | -0.504 | -0.755 |
| -0.628318530718018 | -0.248 | -0.496 | -0.744 |
| -0.625176938064428 | -0.244 | -0.489 | -0.733 |
| -0.622035345410838 | -0.241 | -0.481 | -0.722 |
| -0.618893752757248 | -0.237 | -0.474 | -0.711 |
| -0.615752160103659 | -0.233 | -0.467 | -0.7 |
| -0.612610567450069 | -0.23 | -0.46 | -0.69 |
| -0.609468974796479 | -0.226 | -0.453 | -0.679 |
| -0.606327382142889 | -0.223 | -0.446 | -0.669 |
| -0.603185789489299 | -0.219 | -0.439 | -0.658 |
| -0.600044196835709 | -0.216 | -0.432 | -0.648 |
| -0.59690260418212 | -0.213 | -0.425 | -0.638 |
| -0.59376101152853 | -0.209 | -0.419 | -0.628 |
| -0.59061941887494 | -0.206 | -0.412 | -0.618 |
| -0.58747782622135 | -0.203 | -0.406 | -0.608 |
| -0.58433623356776 | -0.2 | -0.399 | -0.599 |
| -0.581194640914171 | -0.196 | -0.393 | -0.589 |
| -0.578053048260581 | -0.193 | -0.386 | -0.579 |
| -0.574911455606991 | -0.19 | -0.38 | -0.57 |
| -0.571769862953401 | -0.187 | -0.374 | -0.561 |
| -0.568628270299811 | -0.184 | -0.368 | -0.552 |
| -0.565486677646222 | -0.181 | -0.362 | -0.542 |
| -0.562345084992632 | -0.178 | -0.356 | -0.533 |
| -0.559203492339042 | -0.175 | -0.35 | -0.525 |
| -0.556061899685452 | -0.172 | -0.344 | -0.516 |
| -0.552920307031862 | -0.169 | -0.338 | -0.507 |
| -0.549778714378272 | -0.166 | -0.332 | -0.499 |
| -0.546637121724683 | -0.163 | -0.327 | -0.49 |
| -0.543495529071093 | -0.161 | -0.321 | -0.482 |
| -0.540353936417503 | -0.158 | -0.316 | -0.473 |
| -0.537212343763913 | -0.155 | -0.31 | -0.465 |
| -0.534070751110323 | -0.152 | -0.305 | -0.457 |
| -0.530929158456733 | -0.15 | -0.299 | -0.449 |
| -0.527787565803144 | -0.147 | -0.294 | -0.441 |
| -0.524645973149554 | -0.144 | -0.289 | -0.433 |
| -0.521504380495964 | -0.142 | -0.284 | -0.425 |
| -0.518362787842374 | -0.139 | -0.279 | -0.418 |
| -0.515221195188784 | -0.137 | -0.274 | -0.41 |
| -0.512079602535195 | -0.134 | -0.269 | -0.403 |
| -0.508938009881605 | -0.132 | -0.264 | -0.395 |
| -0.505796417228015 | -0.129 | -0.259 | -0.388 |
| -0.502654824574425 | -0.127 | -0.254 | -0.381 |
| -0.499513231920835 | -0.125 | -0.249 | -0.374 |
| -0.496371639267245 | -0.122 | -0.245 | -0.367 |
| -0.493230046613656 | -0.12 | -0.24 | -0.36 |
| -0.490088453960066 | -0.118 | -0.235 | -0.353 |
| -0.486946861306476 | -0.115 | -0.231 | -0.346 |
| -0.483805268652886 | -0.113 | -0.226 | -0.34 |
| -0.480663675999296 | -0.111 | -0.222 | -0.333 |
| -0.477522083345707 | -0.109 | -0.218 | -0.327 |
| -0.474380490692117 | -0.107 | -0.214 | -0.32 |
| -0.471238898038527 | -0.105 | -0.209 | -0.314 |
| -0.468097305384937 | -0.103 | -0.205 | -0.308 |
| -0.464955712731347 | -0.101 | -0.201 | -0.302 |
| -0.461814120077757 | -0.098 | -0.197 | -0.295 |
| -0.458672527424168 | -0.096 | -0.193 | -0.289 |
| -0.455530934770578 | -0.095 | -0.189 | -0.284 |
| -0.452389342116988 | -0.093 | -0.185 | -0.278 |
| -0.449247749463398 | -0.091 | -0.181 | -0.272 |
| -0.446106156809808 | -0.089 | -0.178 | -0.266 |
| -0.442964564156219 | -0.087 | -0.174 | -0.261 |
| -0.439822971502629 | -0.085 | -0.17 | -0.255 |
| -0.436681378849039 | -0.083 | -0.167 | -0.25 |
| -0.433539786195449 | -0.081 | -0.163 | -0.244 |
| -0.430398193541859 | -0.08 | -0.159 | -0.239 |
| -0.427256600888269 | -0.078 | -0.156 | -0.234 |
| -0.42411500823468 | -0.076 | -0.153 | -0.229 |
| -0.42097341558109 | -0.075 | -0.149 | -0.224 |
| -0.4178318229275 | -0.073 | -0.146 | -0.219 |
| -0.41469023027391 | -0.071 | -0.143 | -0.214 |
| -0.41154863762032 | -0.07 | -0.139 | -0.209 |
| -0.408407044966731 | -0.068 | -0.136 | -0.204 |
| -0.405265452313141 | -0.067 | -0.133 | -0.2 |
| -0.402123859659551 | -0.065 | -0.13 | -0.195 |
| -0.398982267005961 | -0.064 | -0.127 | -0.191 |
| -0.395840674352371 | -0.062 | -0.124 | -0.186 |
| -0.392699081698781 | -0.061 | -0.121 | -0.182 |
| -0.389557489045192 | -0.059 | -0.118 | -0.177 |
| -0.386415896391602 | -0.058 | -0.115 | -0.173 |
| -0.383274303738012 | -0.056 | -0.113 | -0.169 |
| -0.380132711084422 | -0.055 | -0.11 | -0.165 |
| -0.376991118430832 | -0.054 | -0.107 | -0.161 |
| -0.373849525777242 | -0.052 | -0.105 | -0.157 |
| -0.370707933123653 | -0.051 | -0.102 | -0.153 |
| -0.367566340470063 | -0.05 | -0.099 | -0.149 |
| -0.364424747816473 | -0.048 | -0.097 | -0.145 |
| -0.361283155162883 | -0.047 | -0.094 | -0.141 |
| -0.358141562509293 | -0.046 | -0.092 | -0.138 |
| -0.354999969855704 | -0.045 | -0.089 | -0.134 |
| -0.351858377202114 | -0.044 | -0.087 | -0.131 |
| -0.348716784548524 | -0.042 | -0.085 | -0.127 |
| -0.345575191894934 | -0.041 | -0.083 | -0.124 |
| -0.342433599241344 | -0.04 | -0.08 | -0.12 |
| -0.339292006587754 | -0.039 | -0.078 | -0.117 |
| -0.336150413934165 | -0.038 | -0.076 | -0.114 |
| -0.333008821280575 | -0.037 | -0.074 | -0.111 |
| -0.329867228626985 | -0.036 | -0.072 | -0.108 |
| -0.326725635973395 | -0.035 | -0.07 | -0.105 |
| -0.323584043319805 | -0.034 | -0.068 | -0.102 |
| -0.320442450666216 | -0.033 | -0.066 | -0.099 |
| -0.317300858012626 | -0.032 | -0.064 | -0.096 |
| -0.314159265359036 | -0.031 | -0.062 | -0.093 |
| -0.311017672705446 | -0.03 | -0.06 | -0.09 |
| -0.307876080051856 | -0.029 | -0.058 | -0.088 |
| -0.304734487398266 | -0.028 | -0.057 | -0.085 |
| -0.301592894744677 | -0.027 | -0.055 | -0.082 |
| -0.298451302091087 | -0.027 | -0.053 | -0.08 |
| -0.295309709437497 | -0.026 | -0.052 | -0.077 |
| -0.292168116783907 | -0.025 | -0.05 | -0.075 |
| -0.289026524130317 | -0.024 | -0.048 | -0.072 |
| -0.285884931476728 | -0.023 | -0.047 | -0.07 |
| -0.282743338823138 | -0.023 | -0.045 | -0.068 |
| -0.279601746169548 | -0.022 | -0.044 | -0.066 |
| -0.276460153515958 | -0.021 | -0.042 | -0.063 |
| -0.273318560862368 | -0.02 | -0.041 | -0.061 |
| -0.270176968208778 | -0.02 | -0.039 | -0.059 |
| -0.267035375555189 | -0.019 | -0.038 | -0.057 |
| -0.263893782901599 | -0.018 | -0.037 | -0.055 |
| -0.260752190248009 | -0.018 | -0.035 | -0.053 |
| -0.257610597594419 | -0.017 | -0.034 | -0.051 |
| -0.254469004940829 | -0.016 | -0.033 | -0.049 |
| -0.25132741228724 | -0.016 | -0.032 | -0.048 |
| -0.24818581963365 | -0.015 | -0.031 | -0.046 |
| -0.24504422698006 | -0.015 | -0.029 | -0.044 |
| -0.24190263432647 | -0.014 | -0.028 | -0.042 |
| -0.23876104167288 | -0.014 | -0.027 | -0.041 |
| -0.235619449019291 | -0.013 | -0.026 | -0.039 |
| -0.232477856365701 | -0.013 | -0.025 | -0.038 |
| -0.229336263712111 | -0.012 | -0.024 | -0.036 |
| -0.226194671058521 | -0.012 | -0.023 | -0.035 |
| -0.223053078404931 | -0.011 | -0.022 | -0.033 |
| -0.219911485751342 | -0.011 | -0.021 | -0.032 |
| -0.216769893097752 | -0.01 | -0.02 | -0.031 |
| -0.213628300444162 | -0.01 | -0.019 | -0.029 |
| -0.210486707790572 | -0.009 | -0.019 | -0.028 |
| -0.207345115136982 | -0.009 | -0.018 | -0.027 |
| -0.204203522483393 | -0.009 | -0.017 | -0.026 |
| -0.201061929829803 | -0.008 | -0.016 | -0.024 |
| -0.197920337176213 | -0.008 | -0.016 | -0.023 |
| -0.194778744522623 | -0.007 | -0.015 | -0.022 |
| -0.191637151869033 | -0.007 | -0.014 | -0.021 |
| -0.188495559215444 | -0.007 | -0.013 | -0.02 |
| -0.185353966561854 | -0.006 | -0.013 | -0.019 |
| -0.182212373908264 | -0.006 | -0.012 | -0.018 |
| -0.179070781254674 | -0.006 | -0.011 | -0.017 |
| -0.175929188601085 | -0.005 | -0.011 | -0.016 |
| -0.172787595947495 | -0.005 | -0.01 | -0.015 |
| -0.169646003293905 | -0.005 | -0.01 | -0.015 |
| -0.166504410640315 | -0.005 | -0.009 | -0.014 |
| -0.163362817986725 | -0.004 | -0.009 | -0.013 |
| -0.160221225333136 | -0.004 | -0.008 | -0.012 |
| -0.157079632679546 | -0.004 | -0.008 | -0.012 |
| -0.153938040025956 | -0.004 | -0.007 | -0.011 |
| -0.150796447372366 | -0.003 | -0.007 | -0.01 |
| -0.147654854718776 | -0.003 | -0.006 | -0.01 |
| -0.144513262065187 | -0.003 | -0.006 | -0.009 |
| -0.141371669411597 | -0.003 | -0.006 | -0.008 |
| -0.138230076758007 | -0.003 | -0.005 | -0.008 |
| -0.135088484104417 | -0.002 | -0.005 | -0.007 |
| -0.131946891450827 | -0.002 | -0.005 | -0.007 |
| -0.128805298797238 | -0.002 | -0.004 | -0.006 |
| -0.125663706143648 | -0.002 | -0.004 | -0.006 |
| -0.122522113490058 | -0.002 | -0.004 | -0.006 |
| -0.119380520836468 | -0.002 | -0.003 | -0.005 |
| -0.116238928182878 | -0.002 | -0.003 | -0.005 |
| -0.113097335529289 | -0.001 | -0.003 | -0.004 |
| -0.109955742875699 | -0.001 | -0.003 | -0.004 |
| -0.106814150222109 | -0.001 | -0.002 | -0.004 |
| -0.103672557568519 | -0.001 | -0.002 | -0.003 |
| -0.10053096491493 | -0.001 | -0.002 | -0.003 |
| -0.0973893722613397 | -0.001 | -0.002 | -0.003 |
| -0.0942477796077499 | -0.001 | -0.002 | -0.003 |
| -0.0911061869541601 | -0.001 | -0.002 | -0.002 |
| -0.0879645943005703 | -0.001 | -0.001 | -0.002 |
| -0.0848230016469805 | -0.001 | -0.001 | -0.002 |
| -0.0816814089933908 | -0.001 | -0.001 | -0.002 |
| -0.078539816339801 | 0 | -0.001 | -0.001 |
| -0.0753982236862112 | 0 | -0.001 | -0.001 |
| -0.0722566310326214 | 0 | -0.001 | -0.001 |
| -0.0691150383790316 | 0 | -0.001 | -0.001 |
| -0.0659734457254418 | 0 | -0.001 | -0.001 |
| -0.062831853071852 | 0 | 0 | -0.001 |
| -0.0596902604182622 | 0 | 0 | -0.001 |
| -0.0565486677646724 | 0 | 0 | -0.001 |
| -0.0534070751110826 | 0 | 0 | 0 |
| -0.0502654824574928 | 0 | 0 | 0 |
| -0.047123889803903 | 0 | 0 | 0 |
| -0.0439822971503133 | 0 | 0 | 0 |
| -0.0408407044967235 | 0 | 0 | 0 |
| -0.0376991118431337 | 0 | 0 | 0 |
| -0.0345575191895439 | 0 | 0 | 0 |
| -0.0314159265359541 | 0 | 0 | 0 |
| -0.0282743338823643 | 0 | 0 | 0 |
| -0.0251327412287745 | 0 | 0 | 0 |
| -0.0219911485751847 | 0 | 0 | 0 |
| -0.0188495559215949 | 0 | 0 | 0 |
| -0.0157079632680051 | 0 | 0 | 0 |
| -0.0125663706144153 | 0 | 0 | 0 |
| -0.00942477796082555 | 0 | 0 | 0 |
| -0.00628318530723575 | 0 | 0 | 0 |
| -0.00314159265364596 | 0 | 0 | 0 |
| -5.6169478790391e-14 | 0 | 0 | 0 |
| 0.00314159265353362 | 0 | 0 | 0 |
| 0.00628318530712342 | 0 | 0 | 0 |
| 0.00942477796071321 | 0 | 0 | 0 |
| 0.012566370614303 | 0 | 0 | 0 |
| 0.0157079632678928 | 0 | 0 | 0 |
| 0.0188495559214826 | 0 | 0 | 0 |
| 0.0219911485750724 | 0 | 0 | 0 |
| 0.0251327412286622 | 0 | 0 | 0 |
| 0.028274333882252 | 0 | 0 | 0 |
| 0.0314159265358418 | 0 | 0 | 0 |
| 0.0345575191894315 | 0 | 0 | 0 |
| 0.0376991118430213 | 0 | 0 | 0 |
| 0.0408407044966111 | 0 | 0 | 0 |
| 0.0439822971502009 | 0 | 0 | 0 |
| 0.0471238898037907 | 0 | 0 | 0 |
| 0.0502654824573805 | 0 | 0 | 0 |
| 0.0534070751109703 | 0 | 0 | 0 |
| 0.0565486677645601 | 0 | 0 | 0.001 |
| 0.0596902604181499 | 0 | 0 | 0.001 |
| 0.0628318530717397 | 0 | 0 | 0.001 |
| 0.0659734457253295 | 0 | 0.001 | 0.001 |
| 0.0691150383789192 | 0 | 0.001 | 0.001 |
| 0.072256631032509 | 0 | 0.001 | 0.001 |
| 0.0753982236860988 | 0 | 0.001 | 0.001 |
| 0.0785398163396886 | 0 | 0.001 | 0.001 |
| 0.0816814089932784 | 0.001 | 0.001 | 0.002 |
| 0.0848230016468682 | 0.001 | 0.001 | 0.002 |
| 0.087964594300458 | 0.001 | 0.001 | 0.002 |
| 0.0911061869540478 | 0.001 | 0.002 | 0.002 |
| 0.0942477796076376 | 0.001 | 0.002 | 0.003 |
| 0.0973893722612274 | 0.001 | 0.002 | 0.003 |
| 0.100530964914817 | 0.001 | 0.002 | 0.003 |
| 0.103672557568407 | 0.001 | 0.002 | 0.003 |
| 0.106814150221997 | 0.001 | 0.002 | 0.004 |
| 0.109955742875587 | 0.001 | 0.003 | 0.004 |
| 0.113097335529176 | 0.001 | 0.003 | 0.004 |
| 0.116238928182766 | 0.002 | 0.003 | 0.005 |
| 0.119380520836356 | 0.002 | 0.003 | 0.005 |
| 0.122522113489946 | 0.002 | 0.004 | 0.006 |
| 0.125663706143536 | 0.002 | 0.004 | 0.006 |
| 0.128805298797125 | 0.002 | 0.004 | 0.006 |
| 0.131946891450715 | 0.002 | 0.005 | 0.007 |
| 0.135088484104305 | 0.002 | 0.005 | 0.007 |
| 0.138230076757895 | 0.003 | 0.005 | 0.008 |
| 0.141371669411484 | 0.003 | 0.006 | 0.008 |
| 0.144513262065074 | 0.003 | 0.006 | 0.009 |
| 0.147654854718664 | 0.003 | 0.006 | 0.01 |
| 0.150796447372254 | 0.003 | 0.007 | 0.01 |
| 0.153938040025844 | 0.004 | 0.007 | 0.011 |
| 0.157079632679433 | 0.004 | 0.008 | 0.012 |
| 0.160221225333023 | 0.004 | 0.008 | 0.012 |
| 0.163362817986613 | 0.004 | 0.009 | 0.013 |
| 0.166504410640203 | 0.005 | 0.009 | 0.014 |
| 0.169646003293793 | 0.005 | 0.01 | 0.015 |
| 0.172787595947382 | 0.005 | 0.01 | 0.015 |
| 0.175929188600972 | 0.005 | 0.011 | 0.016 |
| 0.179070781254562 | 0.006 | 0.011 | 0.017 |
| 0.182212373908152 | 0.006 | 0.012 | 0.018 |
| 0.185353966561742 | 0.006 | 0.013 | 0.019 |
| 0.188495559215331 | 0.007 | 0.013 | 0.02 |
| 0.191637151868921 | 0.007 | 0.014 | 0.021 |
| 0.194778744522511 | 0.007 | 0.015 | 0.022 |
| 0.197920337176101 | 0.008 | 0.016 | 0.023 |
| 0.201061929829691 | 0.008 | 0.016 | 0.024 |
| 0.20420352248328 | 0.009 | 0.017 | 0.026 |
| 0.20734511513687 | 0.009 | 0.018 | 0.027 |
| 0.21048670779046 | 0.009 | 0.019 | 0.028 |
| 0.21362830044405 | 0.01 | 0.019 | 0.029 |
| 0.216769893097639 | 0.01 | 0.02 | 0.031 |
| 0.219911485751229 | 0.011 | 0.021 | 0.032 |
| 0.223053078404819 | 0.011 | 0.022 | 0.033 |
| 0.226194671058409 | 0.012 | 0.023 | 0.035 |
| 0.229336263711999 | 0.012 | 0.024 | 0.036 |
| 0.232477856365588 | 0.013 | 0.025 | 0.038 |
| 0.235619449019178 | 0.013 | 0.026 | 0.039 |
| 0.238761041672768 | 0.014 | 0.027 | 0.041 |
| 0.241902634326358 | 0.014 | 0.028 | 0.042 |
| 0.245044226979948 | 0.015 | 0.029 | 0.044 |
| 0.248185819633537 | 0.015 | 0.031 | 0.046 |
| 0.251327412287127 | 0.016 | 0.032 | 0.048 |
| 0.254469004940717 | 0.016 | 0.033 | 0.049 |
| 0.257610597594307 | 0.017 | 0.034 | 0.051 |
| 0.260752190247897 | 0.018 | 0.035 | 0.053 |
| 0.263893782901486 | 0.018 | 0.037 | 0.055 |
| 0.267035375555076 | 0.019 | 0.038 | 0.057 |
| 0.270176968208666 | 0.02 | 0.039 | 0.059 |
| 0.273318560862256 | 0.02 | 0.041 | 0.061 |
| 0.276460153515846 | 0.021 | 0.042 | 0.063 |
| 0.279601746169436 | 0.022 | 0.044 | 0.066 |
| 0.282743338823025 | 0.023 | 0.045 | 0.068 |
| 0.285884931476615 | 0.023 | 0.047 | 0.07 |
| 0.289026524130205 | 0.024 | 0.048 | 0.072 |
| 0.292168116783795 | 0.025 | 0.05 | 0.075 |
| 0.295309709437385 | 0.026 | 0.052 | 0.077 |
| 0.298451302090974 | 0.027 | 0.053 | 0.08 |
| 0.301592894744564 | 0.027 | 0.055 | 0.082 |
| 0.304734487398154 | 0.028 | 0.057 | 0.085 |
| 0.307876080051744 | 0.029 | 0.058 | 0.088 |
| 0.311017672705334 | 0.03 | 0.06 | 0.09 |
| 0.314159265358924 | 0.031 | 0.062 | 0.093 |
| 0.317300858012513 | 0.032 | 0.064 | 0.096 |
| 0.320442450666103 | 0.033 | 0.066 | 0.099 |
| 0.323584043319693 | 0.034 | 0.068 | 0.102 |
| 0.326725635973283 | 0.035 | 0.07 | 0.105 |
| 0.329867228626873 | 0.036 | 0.072 | 0.108 |
| 0.333008821280463 | 0.037 | 0.074 | 0.111 |
| 0.336150413934052 | 0.038 | 0.076 | 0.114 |
| 0.339292006587642 | 0.039 | 0.078 | 0.117 |
| 0.342433599241232 | 0.04 | 0.08 | 0.12 |
| 0.345575191894822 | 0.041 | 0.083 | 0.124 |
| 0.348716784548412 | 0.042 | 0.085 | 0.127 |
| 0.351858377202001 | 0.044 | 0.087 | 0.131 |
| 0.354999969855591 | 0.045 | 0.089 | 0.134 |
| 0.358141562509181 | 0.046 | 0.092 | 0.138 |
| 0.361283155162771 | 0.047 | 0.094 | 0.141 |
| 0.364424747816361 | 0.048 | 0.097 | 0.145 |
| 0.367566340469951 | 0.05 | 0.099 | 0.149 |
| 0.37070793312354 | 0.051 | 0.102 | 0.153 |
| 0.37384952577713 | 0.052 | 0.105 | 0.157 |
| 0.37699111843072 | 0.054 | 0.107 | 0.161 |
| 0.38013271108431 | 0.055 | 0.11 | 0.165 |
| 0.3832743037379 | 0.056 | 0.113 | 0.169 |
| 0.386415896391489 | 0.058 | 0.115 | 0.173 |
| 0.389557489045079 | 0.059 | 0.118 | 0.177 |
| 0.392699081698669 | 0.061 | 0.121 | 0.182 |
| 0.395840674352259 | 0.062 | 0.124 | 0.186 |
| 0.398982267005849 | 0.064 | 0.127 | 0.191 |
| 0.402123859659439 | 0.065 | 0.13 | 0.195 |
| 0.405265452313028 | 0.067 | 0.133 | 0.2 |
| 0.408407044966618 | 0.068 | 0.136 | 0.204 |
| 0.411548637620208 | 0.07 | 0.139 | 0.209 |
| 0.414690230273798 | 0.071 | 0.143 | 0.214 |
| 0.417831822927388 | 0.073 | 0.146 | 0.219 |
| 0.420973415580977 | 0.075 | 0.149 | 0.224 |
| 0.424115008234567 | 0.076 | 0.153 | 0.229 |
| 0.427256600888157 | 0.078 | 0.156 | 0.234 |
| 0.430398193541747 | 0.08 | 0.159 | 0.239 |
| 0.433539786195337 | 0.081 | 0.163 | 0.244 |
| 0.436681378848927 | 0.083 | 0.167 | 0.25 |
| 0.439822971502516 | 0.085 | 0.17 | 0.255 |
| 0.442964564156106 | 0.087 | 0.174 | 0.261 |
| 0.446106156809696 | 0.089 | 0.178 | 0.266 |
| 0.449247749463286 | 0.091 | 0.181 | 0.272 |
| 0.452389342116876 | 0.093 | 0.185 | 0.278 |
| 0.455530934770465 | 0.095 | 0.189 | 0.284 |
| 0.458672527424055 | 0.096 | 0.193 | 0.289 |
| 0.461814120077645 | 0.098 | 0.197 | 0.295 |
| 0.464955712731235 | 0.101 | 0.201 | 0.302 |
| 0.468097305384825 | 0.103 | 0.205 | 0.308 |
| 0.471238898038415 | 0.105 | 0.209 | 0.314 |
| 0.474380490692004 | 0.107 | 0.214 | 0.32 |
| 0.477522083345594 | 0.109 | 0.218 | 0.327 |
| 0.480663675999184 | 0.111 | 0.222 | 0.333 |
| 0.483805268652774 | 0.113 | 0.226 | 0.34 |
| 0.486946861306364 | 0.115 | 0.231 | 0.346 |
| 0.490088453959953 | 0.118 | 0.235 | 0.353 |
| 0.493230046613543 | 0.12 | 0.24 | 0.36 |
| 0.496371639267133 | 0.122 | 0.245 | 0.367 |
| 0.499513231920723 | 0.125 | 0.249 | 0.374 |
| 0.502654824574313 | 0.127 | 0.254 | 0.381 |
| 0.505796417227903 | 0.129 | 0.259 | 0.388 |
| 0.508938009881492 | 0.132 | 0.264 | 0.395 |
| 0.512079602535082 | 0.134 | 0.269 | 0.403 |
| 0.515221195188672 | 0.137 | 0.274 | 0.41 |
| 0.518362787842262 | 0.139 | 0.279 | 0.418 |
| 0.521504380495852 | 0.142 | 0.284 | 0.425 |
| 0.524645973149441 | 0.144 | 0.289 | 0.433 |
| 0.527787565803031 | 0.147 | 0.294 | 0.441 |
| 0.530929158456621 | 0.15 | 0.299 | 0.449 |
| 0.534070751110211 | 0.152 | 0.305 | 0.457 |
| 0.537212343763801 | 0.155 | 0.31 | 0.465 |
| 0.540353936417391 | 0.158 | 0.316 | 0.473 |
| 0.54349552907098 | 0.161 | 0.321 | 0.482 |
| 0.54663712172457 | 0.163 | 0.327 | 0.49 |
| 0.54977871437816 | 0.166 | 0.332 | 0.499 |
| 0.55292030703175 | 0.169 | 0.338 | 0.507 |
| 0.55606189968534 | 0.172 | 0.344 | 0.516 |
| 0.55920349233893 | 0.175 | 0.35 | 0.525 |
| 0.562345084992519 | 0.178 | 0.356 | 0.533 |
| 0.565486677646109 | 0.181 | 0.362 | 0.542 |
| 0.568628270299699 | 0.184 | 0.368 | 0.552 |
| 0.571769862953289 | 0.187 | 0.374 | 0.561 |
| 0.574911455606879 | 0.19 | 0.38 | 0.57 |
| 0.578053048260468 | 0.193 | 0.386 | 0.579 |
| 0.581194640914058 | 0.196 | 0.393 | 0.589 |
| 0.584336233567648 | 0.2 | 0.399 | 0.599 |
| 0.587477826221238 | 0.203 | 0.406 | 0.608 |
| 0.590619418874828 | 0.206 | 0.412 | 0.618 |
| 0.593761011528418 | 0.209 | 0.419 | 0.628 |
| 0.596902604182007 | 0.213 | 0.425 | 0.638 |
| 0.600044196835597 | 0.216 | 0.432 | 0.648 |
| 0.603185789489187 | 0.219 | 0.439 | 0.658 |
| 0.606327382142777 | 0.223 | 0.446 | 0.669 |
| 0.609468974796367 | 0.226 | 0.453 | 0.679 |
| 0.612610567449956 | 0.23 | 0.46 | 0.69 |
| 0.615752160103546 | 0.233 | 0.467 | 0.7 |
| 0.618893752757136 | 0.237 | 0.474 | 0.711 |
| 0.622035345410726 | 0.241 | 0.481 | 0.722 |
| 0.625176938064316 | 0.244 | 0.489 | 0.733 |
| 0.628318530717905 | 0.248 | 0.496 | 0.744 |
| 0.631460123371495 | 0.252 | 0.504 | 0.755 |
| 0.634601716025085 | 0.256 | 0.511 | 0.767 |
| 0.637743308678675 | 0.259 | 0.519 | 0.778 |
| 0.640884901332265 | 0.263 | 0.526 | 0.79 |
| 0.644026493985855 | 0.267 | 0.534 | 0.801 |
| 0.647168086639444 | 0.271 | 0.542 | 0.813 |
| 0.650309679293034 | 0.275 | 0.55 | 0.825 |
| 0.653451271946624 | 0.279 | 0.558 | 0.837 |
| 0.656592864600214 | 0.283 | 0.566 | 0.849 |
| 0.659734457253804 | 0.287 | 0.574 | 0.861 |
| 0.662876049907393 | 0.291 | 0.583 | 0.874 |
| 0.666017642560983 | 0.295 | 0.591 | 0.886 |
| 0.669159235214573 | 0.3 | 0.599 | 0.899 |
| 0.672300827868163 | 0.304 | 0.608 | 0.912 |
| 0.675442420521753 | 0.308 | 0.616 | 0.924 |
| 0.678584013175343 | 0.312 | 0.625 | 0.937 |
| 0.681725605828932 | 0.317 | 0.634 | 0.95 |
| 0.684867198482522 | 0.321 | 0.642 | 0.964 |
| 0.688008791136112 | 0.326 | 0.651 | 0.977 |
| 0.691150383789702 | 0.33 | 0.66 | 0.99 |
| 0.694291976443292 | 0.335 | 0.669 | 1.004 |
| 0.697433569096881 | 0.339 | 0.678 | 1.018 |
| 0.700575161750471 | 0.344 | 0.688 | 1.032 |
| 0.703716754404061 | 0.348 | 0.697 | 1.045 |
| 0.706858347057651 | 0.353 | 0.706 | 1.06 |
| 0.709999939711241 | 0.358 | 0.716 | 1.074 |
| 0.713141532364831 | 0.363 | 0.725 | 1.088 |
| 0.71628312501842 | 0.367 | 0.735 | 1.102 |
| 0.71942471767201 | 0.372 | 0.745 | 1.117 |
| 0.7225663103256 | 0.377 | 0.755 | 1.132 |
| 0.72570790297919 | 0.382 | 0.764 | 1.147 |
| 0.72884949563278 | 0.387 | 0.774 | 1.162 |
| 0.73199108828637 | 0.392 | 0.784 | 1.177 |
| 0.735132680939959 | 0.397 | 0.795 | 1.192 |
| 0.738274273593549 | 0.402 | 0.805 | 1.207 |
| 0.741415866247139 | 0.408 | 0.815 | 1.223 |
| 0.744557458900729 | 0.413 | 0.826 | 1.238 |
| 0.747699051554319 | 0.418 | 0.836 | 1.254 |
| 0.750840644207908 | 0.423 | 0.847 | 1.27 |
| 0.753982236861498 | 0.429 | 0.857 | 1.286 |
| 0.757123829515088 | 0.434 | 0.868 | 1.302 |
| 0.760265422168678 | 0.439 | 0.879 | 1.318 |
| 0.763407014822268 | 0.445 | 0.89 | 1.335 |
| 0.766548607475858 | 0.45 | 0.901 | 1.351 |
| 0.769690200129447 | 0.456 | 0.912 | 1.368 |
| 0.772831792783037 | 0.462 | 0.923 | 1.385 |
| 0.775973385436627 | 0.467 | 0.934 | 1.402 |
| 0.779114978090217 | 0.473 | 0.946 | 1.419 |
| 0.782256570743807 | 0.479 | 0.957 | 1.436 |
| 0.785398163397396 | 0.484 | 0.969 | 1.453 |
| 0.788539756050986 | 0.49 | 0.981 | 1.471 |
| 0.791681348704576 | 0.496 | 0.992 | 1.489 |
| 0.794822941358166 | 0.502 | 1.004 | 1.506 |
| 0.797964534011756 | 0.508 | 1.016 | 1.524 |
| 0.801106126665346 | 0.514 | 1.028 | 1.542 |
| 0.804247719318935 | 0.52 | 1.04 | 1.561 |
| 0.807389311972525 | 0.526 | 1.053 | 1.579 |
| 0.810530904626115 | 0.532 | 1.065 | 1.597 |
| 0.813672497279705 | 0.539 | 1.077 | 1.616 |
| 0.816814089933295 | 0.545 | 1.09 | 1.635 |
| 0.819955682586885 | 0.551 | 1.103 | 1.654 |
| 0.823097275240474 | 0.558 | 1.115 | 1.673 |
| 0.826238867894064 | 0.564 | 1.128 | 1.692 |
| 0.829380460547654 | 0.571 | 1.141 | 1.712 |
| 0.832522053201244 | 0.577 | 1.154 | 1.731 |
| 0.835663645854834 | 0.584 | 1.167 | 1.751 |
| 0.838805238508423 | 0.59 | 1.18 | 1.771 |
| 0.841946831162013 | 0.597 | 1.194 | 1.791 |
| 0.845088423815603 | 0.604 | 1.207 | 1.811 |
| 0.848230016469193 | 0.61 | 1.221 | 1.831 |
| 0.851371609122783 | 0.617 | 1.234 | 1.851 |
| 0.854513201776373 | 0.624 | 1.248 | 1.872 |
| 0.857654794429962 | 0.631 | 1.262 | 1.893 |
| 0.860796387083552 | 0.638 | 1.276 | 1.913 |
| 0.863937979737142 | 0.645 | 1.29 | 1.935 |
| 0.867079572390732 | 0.652 | 1.304 | 1.956 |
| 0.870221165044322 | 0.659 | 1.318 | 1.977 |
| 0.873362757697911 | 0.666 | 1.332 | 1.999 |
| 0.876504350351501 | 0.673 | 1.347 | 2.02 |
| 0.879645943005091 | 0.681 | 1.361 | 2.042 |
| 0.882787535658681 | 0.688 | 1.376 | 2.064 |
| 0.885929128312271 | 0.695 | 1.391 | 2.086 |
| 0.889070720965861 | 0.703 | 1.406 | 2.108 |
| 0.89221231361945 | 0.71 | 1.42 | 2.131 |
| 0.89535390627304 | 0.718 | 1.436 | 2.153 |
| 0.89849549892663 | 0.725 | 1.451 | 2.176 |
| 0.90163709158022 | 0.733 | 1.466 | 2.199 |
| 0.90477868423381 | 0.741 | 1.481 | 2.222 |
| 0.907920276887399 | 0.748 | 1.497 | 2.245 |
| 0.911061869540989 | 0.756 | 1.512 | 2.269 |
| 0.914203462194579 | 0.764 | 1.528 | 2.292 |
| 0.917345054848169 | 0.772 | 1.544 | 2.316 |
| 0.920486647501759 | 0.78 | 1.56 | 2.34 |
| 0.923628240155349 | 0.788 | 1.576 | 2.364 |
| 0.926769832808938 | 0.796 | 1.592 | 2.388 |
| 0.929911425462528 | 0.804 | 1.608 | 2.412 |
| 0.933053018116118 | 0.812 | 1.625 | 2.437 |
| 0.936194610769708 | 0.821 | 1.641 | 2.462 |
| 0.939336203423298 | 0.829 | 1.658 | 2.486 |
| 0.942477796076888 | 0.837 | 1.674 | 2.512 |
| 0.945619388730477 | 0.846 | 1.691 | 2.537 |
| 0.948760981384067 | 0.854 | 1.708 | 2.562 |
| 0.951902574037657 | 0.863 | 1.725 | 2.588 |
| 0.955044166691247 | 0.871 | 1.742 | 2.613 |
| 0.958185759344837 | 0.88 | 1.759 | 2.639 |
| 0.961327351998426 | 0.888 | 1.777 | 2.665 |
| 0.964468944652016 | 0.897 | 1.794 | 2.691 |
| 0.967610537305606 | 0.906 | 1.812 | 2.718 |
| 0.970752129959196 | 0.915 | 1.83 | 2.744 |
| 0.973893722612786 | 0.924 | 1.847 | 2.771 |
| 0.977035315266376 | 0.933 | 1.865 | 2.798 |
| 0.980176907919965 | 0.942 | 1.883 | 2.825 |
| 0.983318500573555 | 0.951 | 1.902 | 2.852 |
| 0.986460093227145 | 0.96 | 1.92 | 2.88 |
| 0.989601685880735 | 0.969 | 1.938 | 2.907 |
| 0.992743278534325 | 0.978 | 1.957 | 2.935 |
| 0.995884871187914 | 0.988 | 1.975 | 2.963 |
| 0.999026463841504 | 0.997 | 1.994 | 2.991 |
| 1.002168056495094 | 1.007 | 2.013 | 3.02 |
| 1.005309649148684 | 1.016 | 2.032 | 3.048 |
| 1.008451241802274 | 1.026 | 2.051 | 3.077 |
| 1.011592834455864 | 1.035 | 2.07 | 3.106 |
| 1.014734427109453 | 1.045 | 2.09 | 3.135 |
| 1.017876019763043 | 1.055 | 2.109 | 3.164 |
| 1.021017612416633 | 1.064 | 2.129 | 3.193 |
| 1.024159205070223 | 1.074 | 2.148 | 3.223 |
| 1.027300797723813 | 1.084 | 2.168 | 3.252 |
| 1.030442390377402 | 1.094 | 2.188 | 3.282 |
| 1.033583983030992 | 1.104 | 2.208 | 3.313 |
| 1.036725575684582 | 1.114 | 2.229 | 3.343 |
| 1.039867168338172 | 1.124 | 2.249 | 3.373 |
| 1.043008760991762 | 1.135 | 2.269 | 3.404 |
| 1.046150353645352 | 1.145 | 2.29 | 3.435 |
| 1.049291946298941 | 1.155 | 2.311 | 3.466 |
| 1.052433538952531 | 1.166 | 2.331 | 3.497 |
| 1.055575131606121 | 1.176 | 2.352 | 3.528 |
| 1.058716724259711 | 1.187 | 2.373 | 3.56 |
| 1.061858316913301 | 1.197 | 2.395 | 3.592 |
| 1.06499990956689 | 1.208 | 2.416 | 3.624 |
| 1.06814150222048 | 1.219 | 2.437 | 3.656 |
| 1.07128309487407 | 1.229 | 2.459 | 3.688 |
| 1.07442468752766 | 1.24 | 2.481 | 3.721 |
| 1.07756628018125 | 1.251 | 2.502 | 3.754 |
| 1.08070787283484 | 1.262 | 2.524 | 3.787 |
| 1.083849465488429 | 1.273 | 2.546 | 3.82 |
| 1.086991058142019 | 1.284 | 2.569 | 3.853 |
| 1.09013265079561 | 1.296 | 2.591 | 3.887 |
| 1.093274243449199 | 1.307 | 2.613 | 3.92 |
| 1.096415836102789 | 1.318 | 2.636 | 3.954 |
| 1.099557428756378 | 1.329 | 2.659 | 3.988 |
| 1.102699021409968 | 1.341 | 2.682 | 4.022 |
| 1.105840614063558 | 1.352 | 2.705 | 4.057 |
| 1.108982206717148 | 1.364 | 2.728 | 4.092 |
| 1.112123799370738 | 1.375 | 2.751 | 4.126 |
| 1.115265392024328 | 1.387 | 2.774 | 4.162 |
| 1.118406984677917 | 1.399 | 2.798 | 4.197 |
| 1.121548577331507 | 1.411 | 2.822 | 4.232 |
| 1.124690169985097 | 1.423 | 2.845 | 4.268 |
| 1.127831762638687 | 1.435 | 2.869 | 4.304 |
| 1.130973355292277 | 1.447 | 2.893 | 4.34 |
| 1.134114947945867 | 1.459 | 2.917 | 4.376 |
| 1.137256540599456 | 1.471 | 2.942 | 4.413 |
| 1.140398133253046 | 1.483 | 2.966 | 4.449 |
| 1.143539725906636 | 1.495 | 2.991 | 4.486 |
| 1.146681318560226 | 1.508 | 3.015 | 4.523 |
| 1.149822911213816 | 1.52 | 3.04 | 4.561 |
| 1.152964503867405 | 1.533 | 3.065 | 4.598 |
| 1.156106096520995 | 1.545 | 3.09 | 4.636 |
| 1.159247689174585 | 1.558 | 3.116 | 4.674 |
| 1.162389281828175 | 1.571 | 3.141 | 4.712 |
| 1.165530874481765 | 1.583 | 3.167 | 4.75 |
| 1.168672467135355 | 1.596 | 3.192 | 4.789 |
| 1.171814059788944 | 1.609 | 3.218 | 4.827 |
| 1.174955652442534 | 1.622 | 3.244 | 4.866 |
| 1.178097245096124 | 1.635 | 3.27 | 4.905 |
| 1.181238837749714 | 1.648 | 3.296 | 4.945 |
| 1.184380430403304 | 1.661 | 3.323 | 4.984 |
| 1.187522023056893 | 1.675 | 3.349 | 5.024 |
| 1.190663615710483 | 1.688 | 3.376 | 5.064 |
| 1.193805208364073 | 1.701 | 3.403 | 5.104 |
| 1.196946801017663 | 1.715 | 3.43 | 5.145 |
| 1.200088393671253 | 1.728 | 3.457 | 5.185 |
| 1.203229986324843 | 1.742 | 3.484 | 5.226 |
| 1.206371578978432 | 1.756 | 3.511 | 5.267 |
| 1.209513171632022 | 1.769 | 3.539 | 5.308 |
| 1.212654764285612 | 1.783 | 3.566 | 5.35 |
| 1.215796356939202 | 1.797 | 3.594 | 5.391 |
| 1.218937949592792 | 1.811 | 3.622 | 5.433 |
| 1.222079542246381 | 1.825 | 3.65 | 5.475 |
| 1.225221134899971 | 1.839 | 3.679 | 5.518 |
| 1.228362727553561 | 1.853 | 3.707 | 5.56 |
| 1.231504320207151 | 1.868 | 3.735 | 5.603 |
| 1.234645912860741 | 1.882 | 3.764 | 5.646 |
| 1.237787505514331 | 1.896 | 3.793 | 5.689 |
| 1.24092909816792 | 1.911 | 3.822 | 5.733 |
| 1.24407069082151 | 1.925 | 3.851 | 5.776 |
| 1.2472122834751 | 1.94 | 3.88 | 5.82 |
| 1.25035387612869 | 1.955 | 3.91 | 5.864 |
| 1.25349546878228 | 1.97 | 3.939 | 5.909 |
| 1.256637061435869 | 1.984 | 3.969 | 5.953 |
| 1.259778654089459 | 1.999 | 3.999 | 5.998 |
| 1.262920246743049 | 2.014 | 4.029 | 6.043 |
| 1.266061839396639 | 2.029 | 4.059 | 6.088 |
| 1.269203432050229 | 2.045 | 4.089 | 6.134 |
| 1.272345024703819 | 2.06 | 4.12 | 6.179 |
| 1.275486617357408 | 2.075 | 4.15 | 6.225 |
| 1.278628210010998 | 2.09 | 4.181 | 6.271 |
| 1.281769802664588 | 2.106 | 4.212 | 6.318 |
| 1.284911395318178 | 2.121 | 4.243 | 6.364 |
| 1.288052987971768 | 2.137 | 4.274 | 6.411 |
| 1.291194580625357 | 2.153 | 4.305 | 6.458 |
| 1.294336173278947 | 2.168 | 4.337 | 6.505 |
| 1.297477765932537 | 2.184 | 4.368 | 6.553 |
| 1.300619358586127 | 2.2 | 4.4 | 6.6 |
| 1.303760951239717 | 2.216 | 4.432 | 6.648 |
| 1.306902543893307 | 2.232 | 4.464 | 6.697 |
| 1.310044136546896 | 2.248 | 4.497 | 6.745 |
| 1.313185729200486 | 2.265 | 4.529 | 6.794 |
| 1.316327321854076 | 2.281 | 4.562 | 6.842 |
| 1.319468914507666 | 2.297 | 4.594 | 6.892 |
| 1.322610507161256 | 2.314 | 4.627 | 6.941 |
| 1.325752099814845 | 2.33 | 4.66 | 6.99 |
| 1.328893692468435 | 2.347 | 4.694 | 7.04 |
| 1.332035285122025 | 2.363 | 4.727 | 7.09 |
| 1.335176877775615 | 2.38 | 4.76 | 7.141 |
| 1.338318470429205 | 2.397 | 4.794 | 7.191 |
| 1.341460063082795 | 2.414 | 4.828 | 7.242 |
| 1.344601655736384 | 2.431 | 4.862 | 7.293 |
| 1.347743248389974 | 2.448 | 4.896 | 7.344 |
| 1.350884841043564 | 2.465 | 4.93 | 7.396 |
| 1.354026433697154 | 2.482 | 4.965 | 7.447 |
| 1.357168026350744 | 2.5 | 5 | 7.499 |
| 1.360309619004334 | 2.517 | 5.034 | 7.552 |
| 1.363451211657923 | 2.535 | 5.069 | 7.604 |
| 1.366592804311513 | 2.552 | 5.104 | 7.657 |
| 1.369734396965103 | 2.57 | 5.14 | 7.71 |
| 1.372875989618693 | 2.588 | 5.175 | 7.763 |
| 1.376017582272283 | 2.605 | 5.211 | 7.816 |
| 1.379159174925872 | 2.623 | 5.247 | 7.87 |
| 1.382300767579462 | 2.641 | 5.282 | 7.924 |
| 1.385442360233052 | 2.659 | 5.319 | 7.978 |
| 1.388583952886642 | 2.677 | 5.355 | 8.032 |
| 1.391725545540232 | 2.696 | 5.391 | 8.087 |
| 1.394867138193822 | 2.714 | 5.428 | 8.142 |
| 1.398008730847411 | 2.732 | 5.465 | 8.197 |
| 1.401150323501001 | 2.751 | 5.502 | 8.252 |
| 1.404291916154591 | 2.769 | 5.539 | 8.308 |
| 1.407433508808181 | 2.788 | 5.576 | 8.364 |
| 1.410575101461771 | 2.807 | 5.613 | 8.42 |
| 1.41371669411536 | 2.825 | 5.651 | 8.476 |
| 1.41685828676895 | 2.844 | 5.689 | 8.533 |
| 1.41999987942254 | 2.863 | 5.727 | 8.59 |
| 1.42314147207613 | 2.882 | 5.765 | 8.647 |
| 1.42628306472972 | 2.901 | 5.803 | 8.704 |
| 1.42942465738331 | 2.921 | 5.841 | 8.762 |
| 1.432566250036899 | 2.94 | 5.88 | 8.82 |
| 1.435707842690489 | 2.959 | 5.919 | 8.878 |
| 1.438849435344079 | 2.979 | 5.958 | 8.936 |
| 1.441991027997669 | 2.998 | 5.997 | 8.995 |
| 1.445132620651259 | 3.018 | 6.036 | 9.054 |
| 1.448274213304848 | 3.038 | 6.076 | 9.113 |
| 1.451415805958438 | 3.058 | 6.115 | 9.173 |
| 1.454557398612028 | 3.077 | 6.155 | 9.232 |
| 1.457698991265618 | 3.097 | 6.195 | 9.292 |
| 1.460840583919208 | 3.118 | 6.235 | 9.353 |
| 1.463982176572798 | 3.138 | 6.275 | 9.413 |
| 1.467123769226387 | 3.158 | 6.316 | 9.474 |
| 1.470265361879977 | 3.178 | 6.356 | 9.535 |
| 1.473406954533567 | 3.199 | 6.397 | 9.596 |
| 1.476548547187157 | 3.219 | 6.438 | 9.657 |
| 1.479690139840747 | 3.24 | 6.48 | 9.719 |
| 1.482831732494336 | 3.26 | 6.521 | 9.781 |
| 1.485973325147926 | 3.281 | 6.562 | 9.844 |
| 1.489114917801516 | 3.302 | 6.604 | 9.906 |
| 1.492256510455106 | 3.323 | 6.646 | 9.969 |
| 1.495398103108696 | 3.344 | 6.688 | 10.032 |
| 1.498539695762286 | 3.365 | 6.73 | 10.095 |
| 1.501681288415875 | 3.386 | 6.773 | 10.159 |
| 1.504822881069465 | 3.408 | 6.815 | 10.223 |
| 1.507964473723055 | 3.429 | 6.858 | 10.287 |
| 1.511106066376645 | 3.451 | 6.901 | 10.352 |
| 1.514247659030235 | 3.472 | 6.944 | 10.416 |
| 1.517389251683825 | 3.494 | 6.987 | 10.481 |
| 1.520530844337414 | 3.515 | 7.031 | 10.546 |
| 1.523672436991004 | 3.537 | 7.075 | 10.612 |
| 1.526814029644594 | 3.559 | 7.118 | 10.678 |
| 1.529955622298184 | 3.581 | 7.163 | 10.744 |
| 1.533097214951774 | 3.603 | 7.207 | 10.81 |
| 1.536238807605363 | 3.626 | 7.251 | 10.877 |
| 1.539380400258953 | 3.648 | 7.296 | 10.944 |
| 1.542521992912543 | 3.67 | 7.34 | 11.011 |
| 1.545663585566133 | 3.693 | 7.385 | 11.078 |
| 1.548805178219723 | 3.715 | 7.431 | 11.146 |
| 1.551946770873313 | 3.738 | 7.476 | 11.214 |
| 1.555088363526902 | 3.761 | 7.521 | 11.282 |
| 1.558229956180492 | 3.784 | 7.567 | 11.351 |
| 1.561371548834082 | 3.806 | 7.613 | 11.419 |
| 1.564513141487672 | 3.829 | 7.659 | 11.488 |
| 1.567654734141262 | 3.853 | 7.705 | 11.558 |
| 1.570796326794851 | 3.876 | 7.752 | 11.627 |
| 1.573937919448441 | 3.899 | 7.798 | 11.697 |
| 1.577079512102031 | 3.922 | 7.845 | 11.767 |
| 1.580221104755621 | 3.946 | 7.892 | 11.838 |
| 1.583362697409211 | 3.97 | 7.939 | 11.909 |
| 1.586504290062801 | 3.993 | 7.986 | 11.98 |
| 1.58964588271639 | 4.017 | 8.034 | 12.051 |
| 1.59278747536998 | 4.041 | 8.082 | 12.123 |
| 1.59592906802357 | 4.065 | 8.13 | 12.194 |
| 1.59907066067716 | 4.089 | 8.178 | 12.267 |
| 1.60221225333075 | 4.113 | 8.226 | 12.339 |
| 1.605353845984339 | 4.137 | 8.275 | 12.412 |
| 1.608495438637929 | 4.162 | 8.323 | 12.485 |
| 1.61163703129152 | 4.186 | 8.372 | 12.558 |
| 1.614778623945109 | 4.211 | 8.421 | 12.632 |
| 1.617920216598699 | 4.235 | 8.47 | 12.706 |
| 1.621061809252289 | 4.26 | 8.52 | 12.78 |
| 1.624203401905878 | 4.285 | 8.569 | 12.854 |
| 1.627344994559468 | 4.31 | 8.619 | 12.929 |
| 1.630486587213058 | 4.335 | 8.669 | 13.004 |
| 1.633628179866648 | 4.36 | 8.719 | 13.079 |
| 1.636769772520238 | 4.385 | 8.77 | 13.155 |
| 1.639911365173827 | 4.41 | 8.82 | 13.231 |
| 1.643052957827417 | 4.436 | 8.871 | 13.307 |
| 1.646194550481007 | 4.461 | 8.922 | 13.383 |
| 1.649336143134597 | 4.487 | 8.973 | 13.46 |
| 1.652477735788187 | 4.512 | 9.025 | 13.537 |
| 1.655619328441777 | 4.538 | 9.076 | 13.615 |
| 1.658760921095366 | 4.564 | 9.128 | 13.692 |
| 1.661902513748956 | 4.59 | 9.18 | 13.77 |
| 1.665044106402546 | 4.616 | 9.232 | 13.848 |
| 1.668185699056136 | 4.642 | 9.285 | 13.927 |
| 1.671327291709726 | 4.669 | 9.337 | 14.006 |
| 1.674468884363315 | 4.695 | 9.39 | 14.085 |
| 1.677610477016905 | 4.721 | 9.443 | 14.164 |
| 1.680752069670495 | 4.748 | 9.496 | 14.244 |
| 1.683893662324085 | 4.775 | 9.549 | 14.324 |
| 1.687035254977675 | 4.801 | 9.603 | 14.404 |
| 1.690176847631265 | 4.828 | 9.657 | 14.485 |
| 1.693318440284854 | 4.855 | 9.711 | 14.566 |
| 1.696460032938444 | 4.882 | 9.765 | 14.647 |
| 1.699601625592034 | 4.91 | 9.819 | 14.729 |
| 1.702743218245624 | 4.937 | 9.874 | 14.81 |
| 1.705884810899214 | 4.964 | 9.928 | 14.893 |
| 1.709026403552803 | 4.992 | 9.983 | 14.975 |
| 1.712167996206393 | 5.019 | 10.039 | 15.058 |
| 1.715309588859983 | 5.047 | 10.094 | 15.141 |
| 1.718451181513573 | 5.075 | 10.149 | 15.224 |
| 1.721592774167163 | 5.103 | 10.205 | 15.308 |
| 1.724734366820753 | 5.131 | 10.261 | 15.392 |
| 1.727875959474342 | 5.159 | 10.317 | 15.476 |
| 1.731017552127932 | 5.187 | 10.374 | 15.561 |
| 1.734159144781522 | 5.215 | 10.43 | 15.645 |
| 1.737300737435112 | 5.244 | 10.487 | 15.731 |
| 1.740442330088702 | 5.272 | 10.544 | 15.816 |
| 1.743583922742291 | 5.301 | 10.601 | 15.902 |
| 1.746725515395881 | 5.329 | 10.659 | 15.988 |
| 1.749867108049471 | 5.358 | 10.716 | 16.074 |
| 1.753008700703061 | 5.387 | 10.774 | 16.161 |
| 1.756150293356651 | 5.416 | 10.832 | 16.248 |
| 1.759291886010241 | 5.445 | 10.89 | 16.336 |
| 1.76243347866383 | 5.474 | 10.949 | 16.423 |
| 1.76557507131742 | 5.504 | 11.007 | 16.511 |
| 1.76871666397101 | 5.533 | 11.066 | 16.6 |
| 1.7718582566246 | 5.563 | 11.125 | 16.688 |
| 1.77499984927819 | 5.592 | 11.185 | 16.777 |
| 1.77814144193178 | 5.622 | 11.244 | 16.866 |
| 1.78128303458537 | 5.652 | 11.304 | 16.956 |
| 1.784424627238959 | 5.682 | 11.364 | 17.046 |
| 1.787566219892549 | 5.712 | 11.424 | 17.136 |
| 1.790707812546139 | 5.742 | 11.484 | 17.226 |
| 1.793849405199729 | 5.772 | 11.545 | 17.317 |
| 1.796990997853318 | 5.803 | 11.606 | 17.408 |
| 1.800132590506908 | 5.833 | 11.667 | 17.5 |
| 1.803274183160498 | 5.864 | 11.728 | 17.592 |
| 1.806415775814088 | 5.895 | 11.789 | 17.684 |
| 1.809557368467678 | 5.925 | 11.851 | 17.776 |
| 1.812698961121268 | 5.956 | 11.913 | 17.869 |
| 1.815840553774857 | 5.987 | 11.975 | 17.962 |
| 1.818982146428447 | 6.018 | 12.037 | 18.055 |
| 1.822123739082037 | 6.05 | 12.099 | 18.149 |
| 1.825265331735627 | 6.081 | 12.162 | 18.243 |
| 1.828406924389217 | 6.112 | 12.225 | 18.337 |
| 1.831548517042806 | 6.144 | 12.288 | 18.432 |
| 1.834690109696396 | 6.176 | 12.351 | 18.527 |
| 1.837831702349986 | 6.208 | 12.415 | 18.623 |
| 1.840973295003576 | 6.239 | 12.479 | 18.718 |
| 1.844114887657166 | 6.271 | 12.543 | 18.814 |
| 1.847256480310756 | 6.303 | 12.607 | 18.91 |
| 1.850398072964345 | 6.336 | 12.671 | 19.007 |
| 1.853539665617935 | 6.368 | 12.736 | 19.104 |
| 1.856681258271525 | 6.4 | 12.801 | 19.201 |
| 1.859822850925115 | 6.433 | 12.866 | 19.299 |
| 1.862964443578705 | 6.466 | 12.931 | 19.397 |
| 1.866106036232294 | 6.498 | 12.997 | 19.495 |
| 1.869247628885884 | 6.531 | 13.063 | 19.594 |
| 1.872389221539474 | 6.564 | 13.129 | 19.693 |
| 1.875530814193064 | 6.597 | 13.195 | 19.792 |
| 1.878672406846654 | 6.631 | 13.261 | 19.892 |
| 1.881813999500244 | 6.664 | 13.328 | 19.992 |
| 1.884955592153833 | 6.697 | 13.395 | 20.092 |
| 1.888097184807423 | 6.731 | 13.462 | 20.193 |
| 1.891238777461013 | 6.765 | 13.529 | 20.294 |
| 1.894380370114603 | 6.798 | 13.597 | 20.395 |
| 1.897521962768193 | 6.832 | 13.664 | 20.497 |
| 1.900663555421783 | 6.866 | 13.732 | 20.599 |
| 1.903805148075372 | 6.9 | 13.801 | 20.701 |
| 1.906946740728962 | 6.935 | 13.869 | 20.804 |
| 1.910088333382552 | 6.969 | 13.938 | 20.907 |
| 1.913229926036142 | 7.003 | 14.007 | 21.01 |
| 1.916371518689732 | 7.038 | 14.076 | 21.114 |
| 1.919513111343321 | 7.073 | 14.145 | 21.218 |
| 1.922654703996911 | 7.107 | 14.215 | 21.322 |
| 1.925796296650501 | 7.142 | 14.284 | 21.427 |
| 1.928937889304091 | 7.177 | 14.354 | 21.532 |
| 1.932079481957681 | 7.212 | 14.425 | 21.637 |
| 1.935221074611271 | 7.248 | 14.495 | 21.743 |
| 1.93836266726486 | 7.283 | 14.566 | 21.849 |
| 1.94150425991845 | 7.318 | 14.637 | 21.955 |
| 1.94464585257204 | 7.354 | 14.708 | 22.062 |
| 1.94778744522563 | 7.39 | 14.779 | 22.169 |
| 1.95092903787922 | 7.425 | 14.851 | 22.276 |
| 1.954070630532809 | 7.461 | 14.923 | 22.384 |
| 1.957212223186399 | 7.497 | 14.995 | 22.492 |
| 1.960353815839989 | 7.534 | 15.067 | 22.601 |
| 1.963495408493579 | 7.57 | 15.14 | 22.71 |
| 1.966637001147169 | 7.606 | 15.213 | 22.819 |
| 1.969778593800759 | 7.643 | 15.286 | 22.928 |
| 1.972920186454348 | 7.679 | 15.359 | 23.038 |
| 1.976061779107938 | 7.716 | 15.432 | 23.148 |
| 1.979203371761528 | 7.753 | 15.506 | 23.259 |
| 1.982344964415118 | 7.79 | 15.58 | 23.37 |
| 1.985486557068708 | 7.827 | 15.654 | 23.481 |
| 1.988628149722297 | 7.864 | 15.729 | 23.593 |
| 1.991769742375887 | 7.902 | 15.803 | 23.705 |
| 1.994911335029477 | 7.939 | 15.878 | 23.817 |
| 1.998052927683067 | 7.977 | 15.953 | 23.93 |
| 2.001194520336656 | 8.014 | 16.029 | 24.043 |
| 2.004336112990246 | 8.052 | 16.104 | 24.156 |
| 2.007477705643836 | 8.09 | 16.18 | 24.27 |
| 2.010619298297426 | 8.128 | 16.256 | 24.384 |
| 2.013760890951015 | 8.166 | 16.333 | 24.499 |
| 2.016902483604605 | 8.205 | 16.409 | 24.614 |
| 2.020044076258194 | 8.243 | 16.486 | 24.729 |
| 2.023185668911784 | 8.281 | 16.563 | 24.844 |
| 2.026327261565373 | 8.32 | 16.64 | 24.96 |
| 2.029468854218963 | 8.359 | 16.718 | 25.077 |
| 2.032610446872553 | 8.398 | 16.795 | 25.193 |
| 2.035752039526142 | 8.437 | 16.873 | 25.31 |
| 2.038893632179732 | 8.476 | 16.952 | 25.428 |
| 2.042035224833322 | 8.515 | 17.03 | 25.545 |
| 2.045176817486911 | 8.554 | 17.109 | 25.663 |
| 2.048318410140501 | 8.594 | 17.188 | 25.782 |
| 2.05146000279409 | 8.634 | 17.267 | 25.901 |
| 2.05460159544768 | 8.673 | 17.347 | 26.02 |
| 2.05774318810127 | 8.713 | 17.426 | 26.139 |
| 2.06088478075486 | 8.753 | 17.506 | 26.259 |
| 2.064026373408449 | 8.793 | 17.586 | 26.38 |
| 2.067167966062038 | 8.833 | 17.667 | 26.5 |
| 2.070309558715628 | 8.874 | 17.747 | 26.621 |
| 2.073451151369218 | 8.914 | 17.828 | 26.743 |
| 2.076592744022807 | 8.955 | 17.91 | 26.864 |
| 2.079734336676396 | 8.995 | 17.991 | 26.986 |
| 2.082875929329986 | 9.036 | 18.073 | 27.109 |
| 2.086017521983576 | 9.077 | 18.154 | 27.232 |
| 2.089159114637166 | 9.118 | 18.237 | 27.355 |
| 2.092300707290755 | 9.16 | 18.319 | 27.479 |
| 2.095442299944345 | 9.201 | 18.402 | 27.602 |
| 2.098583892597934 | 9.242 | 18.485 | 27.727 |
| 2.101725485251524 | 9.284 | 18.568 | 27.852 |
| 2.104867077905113 | 9.326 | 18.651 | 27.977 |
| 2.108008670558703 | 9.367 | 18.735 | 28.102 |
| 2.111150263212293 | 9.409 | 18.819 | 28.228 |
| 2.114291855865882 | 9.451 | 18.903 | 28.354 |
| 2.117433448519472 | 9.494 | 18.987 | 28.481 |
| 2.120575041173061 | 9.536 | 19.072 | 28.608 |
| 2.123716633826651 | 9.578 | 19.157 | 28.735 |
| 2.126858226480241 | 9.621 | 19.242 | 28.863 |
| 2.12999981913383 | 9.664 | 19.327 | 28.991 |
| 2.13314141178742 | 9.706 | 19.413 | 29.119 |
| 2.136283004441009 | 9.749 | 19.499 | 29.248 |
| 2.1394245970946 | 9.792 | 19.585 | 29.377 |
| 2.142566189748189 | 9.836 | 19.671 | 29.507 |
| 2.145707782401778 | 9.879 | 19.758 | 29.637 |
| 2.148849375055368 | 9.922 | 19.845 | 29.767 |
| 2.151990967708957 | 9.966 | 19.932 | 29.898 |
| 2.155132560362547 | 10.01 | 20.019 | 30.029 |
| 2.158274153016137 | 10.054 | 20.107 | 30.161 |
| 2.161415745669726 | 10.098 | 20.195 | 30.293 |
| 2.164557338323316 | 10.142 | 20.283 | 30.425 |
| 2.167698930976905 | 10.186 | 20.372 | 30.558 |
| 2.170840523630495 | 10.23 | 20.46 | 30.691 |
| 2.173982116284085 | 10.275 | 20.549 | 30.824 |
| 2.177123708937674 | 10.319 | 20.639 | 30.958 |
| 2.180265301591264 | 10.364 | 20.728 | 31.092 |
| 2.183406894244853 | 10.409 | 20.818 | 31.227 |
| 2.186548486898443 | 10.454 | 20.908 | 31.362 |
| 2.189690079552032 | 10.499 | 20.998 | 31.497 |
| 2.192831672205622 | 10.544 | 21.089 | 31.633 |
| 2.195973264859212 | 10.59 | 21.179 | 31.769 |
| 2.199114857512801 | 10.635 | 21.27 | 31.905 |
| 2.202256450166391 | 10.681 | 21.362 | 32.042 |
| 2.20539804281998 | 10.727 | 21.453 | 32.18 |
| 2.20853963547357 | 10.772 | 21.545 | 32.317 |
| 2.21168122812716 | 10.819 | 21.637 | 32.456 |
| 2.214822820780749 | 10.865 | 21.729 | 32.594 |
| 2.21796441343434 | 10.911 | 21.822 | 32.733 |
| 2.221106006087928 | 10.957 | 21.915 | 32.872 |
| 2.224247598741518 | 11.004 | 22.008 | 33.012 |
| 2.227389191395108 | 11.051 | 22.101 | 33.152 |
| 2.230530784048697 | 11.097 | 22.195 | 33.292 |
| 2.233672376702287 | 11.144 | 22.289 | 33.433 |
| 2.236813969355877 | 11.192 | 22.383 | 33.575 |
| 2.239955562009466 | 11.239 | 22.478 | 33.716 |
| 2.243097154663056 | 11.286 | 22.572 | 33.858 |
| 2.246238747316645 | 11.334 | 22.667 | 34.001 |
| 2.249380339970235 | 11.381 | 22.762 | 34.144 |
| 2.252521932623825 | 11.429 | 22.858 | 34.287 |
| 2.255663525277414 | 11.477 | 22.954 | 34.431 |
| 2.258805117931004 | 11.525 | 23.05 | 34.575 |
| 2.261946710584593 | 11.573 | 23.146 | 34.719 |
| 2.265088303238183 | 11.621 | 23.243 | 34.864 |
| 2.268229895891772 | 11.67 | 23.339 | 35.009 |
| 2.271371488545362 | 11.718 | 23.437 | 35.155 |
| 2.274513081198952 | 11.767 | 23.534 | 35.301 |
| 2.277654673852541 | 11.816 | 23.632 | 35.447 |
| 2.28079626650613 | 11.865 | 23.73 | 35.594 |
| 2.28393785915972 | 11.914 | 23.828 | 35.742 |
| 2.28707945181331 | 11.963 | 23.926 | 35.889 |
| 2.2902210444669 | 12.012 | 24.025 | 36.037 |
| 2.293362637120489 | 12.062 | 24.124 | 36.186 |
| 2.296504229774079 | 12.112 | 24.223 | 36.335 |
| 2.299645822427669 | 12.161 | 24.323 | 36.484 |
| 2.302787415081258 | 12.211 | 24.423 | 36.634 |
| 2.305929007734848 | 12.261 | 24.523 | 36.784 |
| 2.309070600388437 | 12.312 | 24.623 | 36.935 |
| 2.312212193042027 | 12.362 | 24.724 | 37.086 |
| 2.315353785695617 | 12.412 | 24.825 | 37.237 |
| 2.318495378349206 | 12.463 | 24.926 | 37.389 |
| 2.321636971002796 | 12.514 | 25.027 | 37.541 |
| 2.324778563656385 | 12.564 | 25.129 | 37.693 |
| 2.327920156309975 | 12.615 | 25.231 | 37.846 |
| 2.331061748963565 | 12.667 | 25.333 | 38 |
| 2.334203341617154 | 12.718 | 25.436 | 38.154 |
| 2.337344934270744 | 12.769 | 25.539 | 38.308 |
| 2.340486526924333 | 12.821 | 25.642 | 38.463 |
| 2.343628119577923 | 12.873 | 25.745 | 38.618 |
| 2.346769712231512 | 12.924 | 25.849 | 38.773 |
| 2.349911304885102 | 12.976 | 25.953 | 38.929 |
| 2.353052897538692 | 13.029 | 26.057 | 39.086 |
| 2.356194490192281 | 13.081 | 26.162 | 39.242 |
| 2.359336082845871 | 13.133 | 26.266 | 39.399 |
| 2.36247767549946 | 13.186 | 26.371 | 39.557 |
| 2.36561926815305 | 13.238 | 26.477 | 39.715 |
| 2.36876086080664 | 13.291 | 26.582 | 39.874 |
| 2.371902453460229 | 13.344 | 26.688 | 40.032 |
| 2.375044046113819 | 13.397 | 26.794 | 40.192 |
| 2.378185638767408 | 13.45 | 26.901 | 40.351 |
| 2.381327231420998 | 13.504 | 27.008 | 40.512 |
| 2.384468824074588 | 13.557 | 27.115 | 40.672 |
| 2.387610416728177 | 13.611 | 27.222 | 40.833 |
| 2.390752009381767 | 13.665 | 27.33 | 40.994 |
| 2.393893602035356 | 13.719 | 27.437 | 41.156 |
| 2.397035194688946 | 13.773 | 27.546 | 41.318 |
| 2.400176787342535 | 13.827 | 27.654 | 41.481 |
| 2.403318379996125 | 13.881 | 27.763 | 41.644 |
| 2.406459972649715 | 13.936 | 27.872 | 41.808 |
| 2.409601565303304 | 13.991 | 27.981 | 41.972 |
| 2.412743157956894 | 14.045 | 28.091 | 42.136 |
| 2.415884750610484 | 14.1 | 28.201 | 42.301 |
| 2.419026343264073 | 14.155 | 28.311 | 42.466 |
| 2.422167935917663 | 14.211 | 28.421 | 42.632 |
| 2.425309528571252 | 14.266 | 28.532 | 42.798 |
| 2.428451121224842 | 14.321 | 28.643 | 42.964 |
| 2.431592713878432 | 14.377 | 28.754 | 43.131 |
| 2.434734306532021 | 14.433 | 28.866 | 43.299 |
| 2.437875899185611 | 14.489 | 28.978 | 43.467 |
| 2.4410174918392 | 14.545 | 29.09 | 43.635 |
| 2.44415908449279 | 14.601 | 29.202 | 43.804 |
| 2.44730067714638 | 14.658 | 29.315 | 43.973 |
| 2.450442269799969 | 14.714 | 29.428 | 44.142 |
| 2.453583862453559 | 14.771 | 29.542 | 44.312 |
| 2.456725455107148 | 14.828 | 29.655 | 44.483 |
| 2.459867047760738 | 14.885 | 29.769 | 44.654 |
| 2.463008640414328 | 14.942 | 29.883 | 44.825 |
| 2.466150233067917 | 14.999 | 29.998 | 44.997 |
| 2.469291825721507 | 15.056 | 30.113 | 45.169 |
| 2.472433418375096 | 15.114 | 30.228 | 45.341 |
| 2.475575011028686 | 15.171 | 30.343 | 45.514 |
| 2.478716603682276 | 15.229 | 30.459 | 45.688 |
| 2.481858196335865 | 15.287 | 30.575 | 45.862 |
| 2.484999788989454 | 15.345 | 30.691 | 46.036 |
| 2.488141381643044 | 15.404 | 30.807 | 46.211 |
| 2.491282974296634 | 15.462 | 30.924 | 46.386 |
| 2.494424566950224 | 15.521 | 31.041 | 46.562 |
| 2.497566159603813 | 15.579 | 31.159 | 46.738 |
| 2.500707752257402 | 15.638 | 31.277 | 46.915 |
| 2.503849344910992 | 15.697 | 31.395 | 47.092 |
| 2.506990937564582 | 15.756 | 31.513 | 47.269 |
| 2.510132530218172 | 15.816 | 31.632 | 47.447 |
| 2.513274122871761 | 15.875 | 31.75 | 47.626 |
| 2.516415715525351 | 15.935 | 31.87 | 47.804 |
| 2.51955730817894 | 15.995 | 31.989 | 47.984 |
| 2.52269890083253 | 16.054 | 32.109 | 48.163 |
| 2.52584049348612 | 16.115 | 32.229 | 48.344 |
| 2.528982086139709 | 16.175 | 32.349 | 48.524 |
| 2.532123678793299 | 16.235 | 32.47 | 48.705 |
| 2.535265271446888 | 16.296 | 32.591 | 48.887 |
| 2.538406864100478 | 16.356 | 32.712 | 49.069 |
| 2.541548456754068 | 16.417 | 32.834 | 49.251 |
| 2.544690049407657 | 16.478 | 32.956 | 49.434 |
| 2.547831642061246 | 16.539 | 33.078 | 49.617 |
| 2.550973234714836 | 16.6 | 33.201 | 49.801 |
| 2.554114827368426 | 16.662 | 33.324 | 49.985 |
| 2.557256420022016 | 16.723 | 33.447 | 50.17 |
| 2.560398012675605 | 16.785 | 33.57 | 50.355 |
| 2.563539605329195 | 16.847 | 33.694 | 50.541 |
| 2.566681197982784 | 16.909 | 33.818 | 50.727 |
| 2.569822790636374 | 16.971 | 33.942 | 50.913 |
| 2.572964383289964 | 17.033 | 34.067 | 51.1 |
| 2.576105975943553 | 17.096 | 34.192 | 51.288 |
| 2.579247568597143 | 17.158 | 34.317 | 51.475 |
| 2.582389161250732 | 17.221 | 34.443 | 51.664 |
| 2.585530753904322 | 17.284 | 34.568 | 51.853 |
| 2.588672346557911 | 17.347 | 34.695 | 52.042 |
| 2.591813939211501 | 17.411 | 34.821 | 52.232 |
| 2.594955531865091 | 17.474 | 34.948 | 52.422 |
| 2.59809712451868 | 17.537 | 35.075 | 52.612 |
| 2.60123871717227 | 17.601 | 35.202 | 52.803 |
| 2.604380309825859 | 17.665 | 35.33 | 52.995 |
| 2.60752190247945 | 17.729 | 35.458 | 53.187 |
| 2.610663495133039 | 17.793 | 35.586 | 53.379 |
| 2.613805087786628 | 17.857 | 35.715 | 53.572 |
| 2.616946680440218 | 17.922 | 35.844 | 53.766 |
| 2.620088273093807 | 17.987 | 35.973 | 53.96 |
| 2.623229865747397 | 18.051 | 36.103 | 54.154 |
| 2.626371458400986 | 18.116 | 36.233 | 54.349 |
| 2.629513051054576 | 18.181 | 36.363 | 54.544 |
| 2.632654643708166 | 18.247 | 36.493 | 54.74 |
| 2.635796236361755 | 18.312 | 36.624 | 54.936 |
| 2.638937829015345 | 18.378 | 36.755 | 55.133 |
| 2.642079421668935 | 18.443 | 36.887 | 55.33 |
| 2.645221014322524 | 18.509 | 37.018 | 55.527 |
| 2.648362606976114 | 18.575 | 37.15 | 55.725 |
| 2.651504199629703 | 18.641 | 37.283 | 55.924 |
| 2.654645792283293 | 18.708 | 37.415 | 56.123 |
| 2.657787384936883 | 18.774 | 37.548 | 56.323 |
| 2.660928977590472 | 18.841 | 37.682 | 56.522 |
| 2.664070570244062 | 18.908 | 37.815 | 56.723 |
| 2.667212162897651 | 18.975 | 37.949 | 56.924 |
| 2.670353755551241 | 19.042 | 38.083 | 57.125 |
| 2.673495348204831 | 19.109 | 38.218 | 57.327 |
| 2.67663694085842 | 19.176 | 38.353 | 57.529 |
| 2.67977853351201 | 19.244 | 38.488 | 57.732 |
| 2.682920126165599 | 19.312 | 38.624 | 57.935 |
| 2.686061718819189 | 19.38 | 38.759 | 58.139 |
| 2.689203311472779 | 19.448 | 38.896 | 58.343 |
| 2.692344904126368 | 19.516 | 39.032 | 58.548 |
| 2.695486496779958 | 19.584 | 39.169 | 58.753 |
| 2.698628089433547 | 19.653 | 39.306 | 58.959 |
| 2.701769682087137 | 19.722 | 39.443 | 59.165 |
| 2.704911274740726 | 19.791 | 39.581 | 59.372 |
| 2.708052867394316 | 19.86 | 39.719 | 59.579 |
| 2.711194460047906 | 19.929 | 39.858 | 59.787 |
| 2.714336052701495 | 19.998 | 39.996 | 59.995 |
| 2.717477645355085 | 20.068 | 40.135 | 60.203 |
| 2.720619238008675 | 20.137 | 40.275 | 60.412 |
| 2.723760830662264 | 20.207 | 40.414 | 60.622 |
| 2.726902423315854 | 20.277 | 40.554 | 60.832 |
| 2.730044015969443 | 20.347 | 40.695 | 61.042 |
| 2.733185608623033 | 20.418 | 40.835 | 61.253 |
| 2.736327201276622 | 20.488 | 40.976 | 61.465 |
| 2.739468793930212 | 20.559 | 41.118 | 61.677 |
| 2.742610386583802 | 20.63 | 41.259 | 61.889 |
| 2.745751979237391 | 20.701 | 41.401 | 62.102 |
| 2.748893571890981 | 20.772 | 41.544 | 62.315 |
| 2.752035164544571 | 20.843 | 41.686 | 62.529 |
| 2.75517675719816 | 20.915 | 41.829 | 62.744 |
| 2.75831834985175 | 20.986 | 41.972 | 62.959 |
| 2.76145994250534 | 21.058 | 42.116 | 63.174 |
| 2.764601535158929 | 21.13 | 42.26 | 63.39 |
| 2.767743127812518 | 21.202 | 42.404 | 63.606 |
| 2.770884720466108 | 21.274 | 42.549 | 63.823 |
| 2.774026313119698 | 21.347 | 42.693 | 64.04 |
| 2.777167905773287 | 21.419 | 42.839 | 64.258 |
| 2.780309498426877 | 21.492 | 42.984 | 64.476 |
| 2.783451091080466 | 21.565 | 43.13 | 64.695 |
| 2.786592683734056 | 21.638 | 43.276 | 64.915 |
| 2.789734276387645 | 21.711 | 43.423 | 65.134 |
| 2.792875869041235 | 21.785 | 43.57 | 65.355 |
| 2.796017461694825 | 21.858 | 43.717 | 65.575 |
| 2.799159054348415 | 21.932 | 43.864 | 65.797 |
| 2.802300647002004 | 22.006 | 44.012 | 66.018 |
| 2.805442239655594 | 22.08 | 44.161 | 66.241 |
| 2.808583832309183 | 22.155 | 44.309 | 66.464 |
| 2.811725424962773 | 22.229 | 44.458 | 66.687 |
| 2.814867017616363 | 22.304 | 44.607 | 66.911 |
| 2.818008610269952 | 22.378 | 44.757 | 67.135 |
| 2.821150202923542 | 22.453 | 44.906 | 67.36 |
| 2.824291795577131 | 22.528 | 45.057 | 67.585 |
| 2.827433388230721 | 22.604 | 45.207 | 67.811 |
| 2.830574980884311 | 22.679 | 45.358 | 68.037 |
| 2.8337165735379 | 22.755 | 45.509 | 68.264 |
| 2.83685816619149 | 22.83 | 45.661 | 68.491 |
| 2.83999975884508 | 22.906 | 45.813 | 68.719 |
| 2.843141351498669 | 22.982 | 45.965 | 68.947 |
| 2.846282944152259 | 23.059 | 46.117 | 69.176 |
| 2.849424536805848 | 23.135 | 46.27 | 69.405 |
| 2.852566129459438 | 23.212 | 46.423 | 69.635 |
| 2.855707722113027 | 23.288 | 46.577 | 69.865 |
| 2.858849314766617 | 23.365 | 46.731 | 70.096 |
| 2.861990907420207 | 23.443 | 46.885 | 70.328 |
| 2.865132500073796 | 23.52 | 47.04 | 70.559 |
| 2.868274092727386 | 23.597 | 47.195 | 70.792 |
| 2.871415685380975 | 23.675 | 47.35 | 71.025 |
| 2.874557278034565 | 23.753 | 47.505 | 71.258 |
| 2.877698870688155 | 23.831 | 47.661 | 71.492 |
| 2.880840463341744 | 23.909 | 47.818 | 71.726 |
| 2.883982055995333 | 23.987 | 47.974 | 71.961 |
| 2.887123648648923 | 24.066 | 48.131 | 72.197 |
| 2.890265241302513 | 24.144 | 48.288 | 72.433 |
| 2.893406833956102 | 24.223 | 48.446 | 72.669 |
| 2.896548426609692 | 24.302 | 48.604 | 72.906 |
| 2.899690019263282 | 24.381 | 48.762 | 73.144 |
| 2.902831611916871 | 24.461 | 48.921 | 73.382 |
| 2.905973204570461 | 24.54 | 49.08 | 73.62 |
| 2.90911479722405 | 24.62 | 49.239 | 73.859 |
| 2.91225638987764 | 24.7 | 49.399 | 74.099 |
| 2.91539798253123 | 24.78 | 49.559 | 74.339 |
| 2.918539575184819 | 24.86 | 49.72 | 74.579 |
| 2.921681167838409 | 24.94 | 49.88 | 74.82 |
| 2.924822760491998 | 25.021 | 50.041 | 75.062 |
| 2.927964353145588 | 25.101 | 50.203 | 75.304 |
| 2.931105945799178 | 25.182 | 50.365 | 75.547 |
| 2.934247538452767 | 25.263 | 50.527 | 75.79 |
| 2.937389131106357 | 25.345 | 50.689 | 76.034 |
| 2.940530723759946 | 25.426 | 50.852 | 76.278 |
| 2.943672316413536 | 25.508 | 51.015 | 76.523 |
| 2.946813909067126 | 25.589 | 51.179 | 76.768 |
| 2.949955501720715 | 25.671 | 51.342 | 77.014 |
| 2.953097094374305 | 25.753 | 51.507 | 77.26 |
| 2.956238687027894 | 25.836 | 51.671 | 77.507 |
| 2.959380279681484 | 25.918 | 51.836 | 77.754 |
| 2.962521872335073 | 26.001 | 52.001 | 78.002 |
| 2.965663464988663 | 26.083 | 52.167 | 78.25 |
| 2.968805057642253 | 26.166 | 52.333 | 78.499 |
| 2.971946650295842 | 26.25 | 52.499 | 78.749 |
| 2.975088242949432 | 26.333 | 52.666 | 78.999 |
| 2.978229835603022 | 26.416 | 52.833 | 79.249 |
| 2.981371428256611 | 26.5 | 53 | 79.5 |
| 2.984513020910201 | 26.584 | 53.168 | 79.752 |
| 2.98765461356379 | 26.668 | 53.336 | 80.004 |
| 2.99079620621738 | 26.752 | 53.505 | 80.257 |
| 2.99393779887097 | 26.837 | 53.673 | 80.51 |
| 2.997079391524559 | 26.921 | 53.842 | 80.764 |
| 3.000220984178149 | 27.006 | 54.012 | 81.018 |
| 3.003362576831738 | 27.091 | 54.182 | 81.273 |
| 3.006504169485328 | 27.176 | 54.352 | 81.528 |
| 3.009645762138918 | 27.261 | 54.523 | 81.784 |
| 3.012787354792507 | 27.347 | 54.693 | 82.04 |
| 3.015928947446097 | 27.432 | 54.865 | 82.297 |
| 3.019070540099686 | 27.518 | 55.036 | 82.555 |
| 3.022212132753276 | 27.604 | 55.208 | 82.813 |
| 3.025353725406866 | 27.69 | 55.381 | 83.071 |
| 3.028495318060455 | 27.777 | 55.553 | 83.33 |
| 3.031636910714045 | 27.863 | 55.726 | 83.59 |
| 3.034778503367634 | 27.95 | 55.9 | 83.85 |
| 3.037920096021224 | 28.037 | 56.074 | 84.111 |
| 3.041061688674814 | 28.124 | 56.248 | 84.372 |
| 3.044203281328403 | 28.211 | 56.422 | 84.633 |
| 3.047344873981992 | 28.299 | 56.597 | 84.896 |
| 3.050486466635582 | 28.386 | 56.772 | 85.159 |
| 3.053628059289172 | 28.474 | 56.948 | 85.422 |
| 3.056769651942762 | 28.562 | 57.124 | 85.686 |
| 3.059911244596351 | 28.65 | 57.3 | 85.95 |
| 3.063052837249941 | 28.738 | 57.477 | 86.215 |
| 3.06619442990353 | 28.827 | 57.654 | 86.481 |
| 3.06933602255712 | 28.916 | 57.831 | 86.747 |
| 3.07247761521071 | 29.005 | 58.009 | 87.014 |
| 3.075619207864299 | 29.094 | 58.187 | 87.281 |
| 3.078760800517889 | 29.183 | 58.366 | 87.549 |
| 3.081902393171478 | 29.272 | 58.545 | 87.817 |
| 3.085043985825068 | 29.362 | 58.724 | 88.086 |
| 3.088185578478657 | 29.452 | 58.903 | 88.355 |
| 3.091327171132247 | 29.542 | 59.083 | 88.625 |
| 3.094468763785837 | 29.632 | 59.264 | 88.895 |
| 3.097610356439426 | 29.722 | 59.444 | 89.166 |
| 3.100751949093016 | 29.813 | 59.625 | 89.438 |
| 3.103893541746605 | 29.903 | 59.807 | 89.71 |
| 3.107035134400195 | 29.994 | 59.989 | 89.983 |
| 3.110176727053785 | 30.085 | 60.171 | 90.256 |
| 3.113318319707374 | 30.177 | 60.353 | 90.53 |
| 3.116459912360964 | 30.268 | 60.536 | 90.804 |
| 3.119601505014554 | 30.36 | 60.719 | 91.079 |
| 3.122743097668143 | 30.452 | 60.903 | 91.355 |
| 3.125884690321733 | 30.544 | 61.087 | 91.631 |
| 3.129026282975322 | 30.636 | 61.271 | 91.907 |
| 3.132167875628912 | 30.728 | 61.456 | 92.184 |
| 3.135309468282502 | 30.821 | 61.641 | 92.462 |
| 3.138451060936091 | 30.913 | 61.827 | 92.74 |
| 3.141592653589681 | 31.006 | 62.013 | 93.019 |